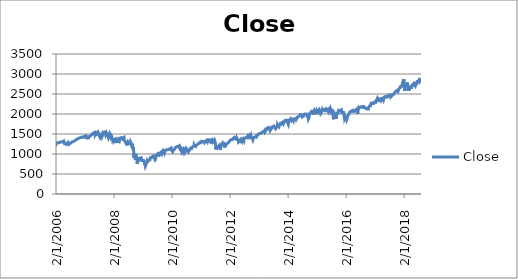
| Category | Close |
|---|---|
| 01/02/2006 | 1282.46 |
| 02/02/2006 | 1270.84 |
| 03/02/2006 | 1264.03 |
| 06/02/2006 | 1265.02 |
| 07/02/2006 | 1254.78 |
| 08/02/2006 | 1265.65 |
| 09/02/2006 | 1263.78 |
| 10/02/2006 | 1266.99 |
| 13/02/2006 | 1262.86 |
| 14/02/2006 | 1275.53 |
| 15/02/2006 | 1280 |
| 16/02/2006 | 1289.38 |
| 17/02/2006 | 1287.24 |
| 21/02/2006 | 1283.03 |
| 22/02/2006 | 1292.67 |
| 23/02/2006 | 1287.79 |
| 24/02/2006 | 1289.43 |
| 27/02/2006 | 1294.12 |
| 28/02/2006 | 1280.66 |
| 01/03/2006 | 1291.24 |
| 02/03/2006 | 1289.14 |
| 03/03/2006 | 1287.23 |
| 06/03/2006 | 1278.26 |
| 07/03/2006 | 1275.88 |
| 08/03/2006 | 1278.47 |
| 09/03/2006 | 1272.23 |
| 10/03/2006 | 1281.42 |
| 13/03/2006 | 1284.13 |
| 14/03/2006 | 1297.48 |
| 15/03/2006 | 1303.02 |
| 16/03/2006 | 1305.33 |
| 17/03/2006 | 1307.25 |
| 20/03/2006 | 1305.08 |
| 21/03/2006 | 1297.23 |
| 22/03/2006 | 1305.04 |
| 23/03/2006 | 1301.67 |
| 24/03/2006 | 1302.95 |
| 27/03/2006 | 1301.61 |
| 28/03/2006 | 1293.23 |
| 29/03/2006 | 1302.89 |
| 30/03/2006 | 1300.25 |
| 31/03/2006 | 1294.87 |
| 03/04/2006 | 1297.81 |
| 04/04/2006 | 1305.93 |
| 05/04/2006 | 1311.56 |
| 06/04/2006 | 1309.04 |
| 07/04/2006 | 1295.5 |
| 10/04/2006 | 1296.62 |
| 11/04/2006 | 1286.57 |
| 12/04/2006 | 1288.12 |
| 13/04/2006 | 1289.12 |
| 17/04/2006 | 1285.33 |
| 18/04/2006 | 1307.28 |
| 19/04/2006 | 1309.93 |
| 20/04/2006 | 1311.46 |
| 21/04/2006 | 1311.28 |
| 24/04/2006 | 1308.11 |
| 25/04/2006 | 1301.74 |
| 26/04/2006 | 1305.41 |
| 27/04/2006 | 1309.72 |
| 28/04/2006 | 1310.61 |
| 01/05/2006 | 1305.19 |
| 02/05/2006 | 1313.21 |
| 03/05/2006 | 1308.12 |
| 04/05/2006 | 1312.25 |
| 05/05/2006 | 1325.76 |
| 08/05/2006 | 1324.66 |
| 09/05/2006 | 1325.14 |
| 10/05/2006 | 1322.85 |
| 11/05/2006 | 1305.92 |
| 12/05/2006 | 1291.24 |
| 15/05/2006 | 1294.5 |
| 16/05/2006 | 1292.08 |
| 17/05/2006 | 1270.32 |
| 18/05/2006 | 1261.81 |
| 19/05/2006 | 1267.03 |
| 22/05/2006 | 1262.07 |
| 23/05/2006 | 1256.58 |
| 24/05/2006 | 1258.57 |
| 25/05/2006 | 1272.88 |
| 26/05/2006 | 1280.16 |
| 30/05/2006 | 1259.87 |
| 31/05/2006 | 1270.09 |
| 01/06/2006 | 1285.71 |
| 02/06/2006 | 1288.22 |
| 05/06/2006 | 1265.29 |
| 06/06/2006 | 1263.85 |
| 07/06/2006 | 1256.15 |
| 08/06/2006 | 1257.93 |
| 09/06/2006 | 1252.3 |
| 12/06/2006 | 1237.44 |
| 13/06/2006 | 1223.69 |
| 14/06/2006 | 1230.04 |
| 15/06/2006 | 1256.16 |
| 16/06/2006 | 1251.54 |
| 19/06/2006 | 1240.13 |
| 20/06/2006 | 1240.12 |
| 21/06/2006 | 1252.2 |
| 22/06/2006 | 1245.6 |
| 23/06/2006 | 1244.5 |
| 26/06/2006 | 1250.56 |
| 27/06/2006 | 1239.2 |
| 28/06/2006 | 1246 |
| 29/06/2006 | 1272.87 |
| 30/06/2006 | 1270.2 |
| 03/07/2006 | 1280.19 |
| 05/07/2006 | 1270.91 |
| 06/07/2006 | 1274.08 |
| 07/07/2006 | 1265.48 |
| 10/07/2006 | 1267.34 |
| 11/07/2006 | 1272.43 |
| 12/07/2006 | 1258.6 |
| 13/07/2006 | 1242.28 |
| 14/07/2006 | 1236.2 |
| 17/07/2006 | 1234.49 |
| 18/07/2006 | 1236.86 |
| 19/07/2006 | 1259.81 |
| 20/07/2006 | 1249.13 |
| 21/07/2006 | 1240.29 |
| 24/07/2006 | 1260.91 |
| 25/07/2006 | 1268.88 |
| 26/07/2006 | 1268.4 |
| 27/07/2006 | 1263.2 |
| 28/07/2006 | 1278.55 |
| 31/07/2006 | 1276.66 |
| 01/08/2006 | 1270.92 |
| 02/08/2006 | 1277.41 |
| 03/08/2006 | 1280.27 |
| 04/08/2006 | 1279.36 |
| 07/08/2006 | 1275.77 |
| 08/08/2006 | 1271.48 |
| 09/08/2006 | 1265.95 |
| 10/08/2006 | 1271.81 |
| 11/08/2006 | 1266.74 |
| 14/08/2006 | 1268.21 |
| 15/08/2006 | 1285.58 |
| 16/08/2006 | 1295.43 |
| 17/08/2006 | 1297.48 |
| 18/08/2006 | 1302.3 |
| 21/08/2006 | 1297.52 |
| 22/08/2006 | 1298.82 |
| 23/08/2006 | 1292.99 |
| 24/08/2006 | 1296.06 |
| 25/08/2006 | 1295.09 |
| 28/08/2006 | 1301.78 |
| 29/08/2006 | 1304.28 |
| 30/08/2006 | 1305.37 |
| 31/08/2006 | 1303.82 |
| 01/09/2006 | 1311.01 |
| 05/09/2006 | 1313.25 |
| 06/09/2006 | 1300.26 |
| 07/09/2006 | 1294.02 |
| 08/09/2006 | 1298.92 |
| 11/09/2006 | 1299.54 |
| 12/09/2006 | 1313 |
| 13/09/2006 | 1318.07 |
| 14/09/2006 | 1316.28 |
| 15/09/2006 | 1319.66 |
| 18/09/2006 | 1321.18 |
| 19/09/2006 | 1317.64 |
| 20/09/2006 | 1325.18 |
| 21/09/2006 | 1318.03 |
| 22/09/2006 | 1314.78 |
| 25/09/2006 | 1326.37 |
| 26/09/2006 | 1336.35 |
| 27/09/2006 | 1336.59 |
| 28/09/2006 | 1338.88 |
| 29/09/2006 | 1335.85 |
| 02/10/2006 | 1331.32 |
| 03/10/2006 | 1334.11 |
| 04/10/2006 | 1350.2 |
| 05/10/2006 | 1353.22 |
| 06/10/2006 | 1349.59 |
| 09/10/2006 | 1350.66 |
| 10/10/2006 | 1353.42 |
| 11/10/2006 | 1349.95 |
| 12/10/2006 | 1362.83 |
| 13/10/2006 | 1365.62 |
| 16/10/2006 | 1369.06 |
| 17/10/2006 | 1364.05 |
| 18/10/2006 | 1365.8 |
| 19/10/2006 | 1366.96 |
| 20/10/2006 | 1368.6 |
| 23/10/2006 | 1377.02 |
| 24/10/2006 | 1377.38 |
| 25/10/2006 | 1382.22 |
| 26/10/2006 | 1389.08 |
| 27/10/2006 | 1377.34 |
| 30/10/2006 | 1377.93 |
| 31/10/2006 | 1377.94 |
| 01/11/2006 | 1367.81 |
| 02/11/2006 | 1367.34 |
| 03/11/2006 | 1364.3 |
| 06/11/2006 | 1379.78 |
| 07/11/2006 | 1382.84 |
| 08/11/2006 | 1385.72 |
| 09/11/2006 | 1378.33 |
| 10/11/2006 | 1380.9 |
| 13/11/2006 | 1384.42 |
| 14/11/2006 | 1393.22 |
| 15/11/2006 | 1396.57 |
| 16/11/2006 | 1399.76 |
| 17/11/2006 | 1401.2 |
| 20/11/2006 | 1400.5 |
| 21/11/2006 | 1402.81 |
| 22/11/2006 | 1406.09 |
| 24/11/2006 | 1400.95 |
| 27/11/2006 | 1381.96 |
| 28/11/2006 | 1386.72 |
| 29/11/2006 | 1399.48 |
| 30/11/2006 | 1400.63 |
| 01/12/2006 | 1396.71 |
| 04/12/2006 | 1409.12 |
| 05/12/2006 | 1414.76 |
| 06/12/2006 | 1412.9 |
| 07/12/2006 | 1407.29 |
| 08/12/2006 | 1409.84 |
| 11/12/2006 | 1413.04 |
| 12/12/2006 | 1411.56 |
| 13/12/2006 | 1413.21 |
| 14/12/2006 | 1425.49 |
| 15/12/2006 | 1427.09 |
| 18/12/2006 | 1422.48 |
| 19/12/2006 | 1425.55 |
| 20/12/2006 | 1423.53 |
| 21/12/2006 | 1418.3 |
| 22/12/2006 | 1410.76 |
| 26/12/2006 | 1416.9 |
| 27/12/2006 | 1426.84 |
| 28/12/2006 | 1424.73 |
| 29/12/2006 | 1418.3 |
| 03/01/2007 | 1416.6 |
| 04/01/2007 | 1418.34 |
| 05/01/2007 | 1409.71 |
| 08/01/2007 | 1412.84 |
| 09/01/2007 | 1412.11 |
| 10/01/2007 | 1414.85 |
| 11/01/2007 | 1423.82 |
| 12/01/2007 | 1430.73 |
| 16/01/2007 | 1431.9 |
| 17/01/2007 | 1430.62 |
| 18/01/2007 | 1426.37 |
| 19/01/2007 | 1430.5 |
| 22/01/2007 | 1422.95 |
| 23/01/2007 | 1427.99 |
| 24/01/2007 | 1440.13 |
| 25/01/2007 | 1423.9 |
| 26/01/2007 | 1422.18 |
| 29/01/2007 | 1420.62 |
| 30/01/2007 | 1428.82 |
| 31/01/2007 | 1438.24 |
| 01/02/2007 | 1445.94 |
| 02/02/2007 | 1448.39 |
| 05/02/2007 | 1446.99 |
| 06/02/2007 | 1448 |
| 07/02/2007 | 1450.02 |
| 08/02/2007 | 1448.31 |
| 09/02/2007 | 1438.06 |
| 12/02/2007 | 1433.37 |
| 13/02/2007 | 1444.26 |
| 14/02/2007 | 1455.3 |
| 15/02/2007 | 1456.81 |
| 16/02/2007 | 1455.54 |
| 20/02/2007 | 1459.68 |
| 21/02/2007 | 1457.63 |
| 22/02/2007 | 1456.38 |
| 23/02/2007 | 1451.19 |
| 26/02/2007 | 1449.37 |
| 27/02/2007 | 1399.04 |
| 28/02/2007 | 1406.82 |
| 01/03/2007 | 1403.17 |
| 02/03/2007 | 1387.17 |
| 05/03/2007 | 1374.12 |
| 06/03/2007 | 1395.41 |
| 07/03/2007 | 1391.97 |
| 08/03/2007 | 1401.89 |
| 09/03/2007 | 1402.84 |
| 12/03/2007 | 1406.6 |
| 13/03/2007 | 1377.95 |
| 14/03/2007 | 1387.17 |
| 15/03/2007 | 1392.28 |
| 16/03/2007 | 1386.95 |
| 19/03/2007 | 1402.06 |
| 20/03/2007 | 1410.94 |
| 21/03/2007 | 1435.04 |
| 22/03/2007 | 1434.54 |
| 23/03/2007 | 1436.11 |
| 26/03/2007 | 1437.5 |
| 27/03/2007 | 1428.61 |
| 28/03/2007 | 1417.23 |
| 29/03/2007 | 1422.53 |
| 30/03/2007 | 1420.86 |
| 02/04/2007 | 1424.55 |
| 03/04/2007 | 1437.77 |
| 04/04/2007 | 1439.37 |
| 05/04/2007 | 1443.76 |
| 09/04/2007 | 1444.61 |
| 10/04/2007 | 1448.39 |
| 11/04/2007 | 1438.87 |
| 12/04/2007 | 1447.8 |
| 13/04/2007 | 1452.85 |
| 16/04/2007 | 1468.33 |
| 17/04/2007 | 1471.48 |
| 18/04/2007 | 1472.5 |
| 19/04/2007 | 1470.73 |
| 20/04/2007 | 1484.35 |
| 23/04/2007 | 1480.93 |
| 24/04/2007 | 1480.41 |
| 25/04/2007 | 1495.42 |
| 26/04/2007 | 1494.25 |
| 27/04/2007 | 1494.07 |
| 30/04/2007 | 1482.37 |
| 01/05/2007 | 1486.3 |
| 02/05/2007 | 1495.92 |
| 03/05/2007 | 1502.39 |
| 04/05/2007 | 1505.62 |
| 07/05/2007 | 1509.48 |
| 08/05/2007 | 1507.72 |
| 09/05/2007 | 1512.58 |
| 10/05/2007 | 1491.47 |
| 11/05/2007 | 1505.85 |
| 14/05/2007 | 1503.15 |
| 15/05/2007 | 1501.19 |
| 16/05/2007 | 1514.14 |
| 17/05/2007 | 1512.75 |
| 18/05/2007 | 1522.75 |
| 21/05/2007 | 1525.1 |
| 22/05/2007 | 1524.12 |
| 23/05/2007 | 1522.28 |
| 24/05/2007 | 1507.51 |
| 25/05/2007 | 1515.73 |
| 29/05/2007 | 1518.11 |
| 30/05/2007 | 1530.23 |
| 31/05/2007 | 1530.62 |
| 01/06/2007 | 1536.34 |
| 04/06/2007 | 1539.18 |
| 05/06/2007 | 1530.95 |
| 06/06/2007 | 1517.38 |
| 07/06/2007 | 1490.72 |
| 08/06/2007 | 1507.67 |
| 11/06/2007 | 1509.12 |
| 12/06/2007 | 1493 |
| 13/06/2007 | 1515.67 |
| 14/06/2007 | 1522.97 |
| 15/06/2007 | 1532.91 |
| 18/06/2007 | 1531.05 |
| 19/06/2007 | 1533.7 |
| 20/06/2007 | 1512.84 |
| 21/06/2007 | 1522.19 |
| 22/06/2007 | 1502.56 |
| 25/06/2007 | 1497.74 |
| 26/06/2007 | 1492.89 |
| 27/06/2007 | 1506.34 |
| 28/06/2007 | 1505.71 |
| 29/06/2007 | 1503.35 |
| 02/07/2007 | 1519.43 |
| 03/07/2007 | 1524.87 |
| 05/07/2007 | 1525.4 |
| 06/07/2007 | 1530.44 |
| 09/07/2007 | 1531.85 |
| 10/07/2007 | 1510.12 |
| 11/07/2007 | 1518.76 |
| 12/07/2007 | 1547.7 |
| 13/07/2007 | 1552.5 |
| 16/07/2007 | 1549.52 |
| 17/07/2007 | 1549.37 |
| 18/07/2007 | 1546.17 |
| 19/07/2007 | 1553.08 |
| 20/07/2007 | 1534.1 |
| 23/07/2007 | 1541.57 |
| 24/07/2007 | 1511.04 |
| 25/07/2007 | 1518.09 |
| 26/07/2007 | 1482.66 |
| 27/07/2007 | 1458.95 |
| 30/07/2007 | 1473.91 |
| 31/07/2007 | 1455.27 |
| 01/08/2007 | 1465.81 |
| 02/08/2007 | 1472.2 |
| 03/08/2007 | 1433.06 |
| 06/08/2007 | 1467.67 |
| 07/08/2007 | 1476.71 |
| 08/08/2007 | 1497.49 |
| 09/08/2007 | 1453.09 |
| 10/08/2007 | 1453.64 |
| 13/08/2007 | 1452.92 |
| 14/08/2007 | 1426.54 |
| 15/08/2007 | 1406.7 |
| 16/08/2007 | 1411.27 |
| 17/08/2007 | 1445.94 |
| 20/08/2007 | 1445.55 |
| 21/08/2007 | 1447.12 |
| 22/08/2007 | 1464.07 |
| 23/08/2007 | 1462.5 |
| 24/08/2007 | 1479.37 |
| 27/08/2007 | 1466.79 |
| 28/08/2007 | 1432.36 |
| 29/08/2007 | 1463.76 |
| 30/08/2007 | 1457.64 |
| 31/08/2007 | 1473.99 |
| 04/09/2007 | 1489.42 |
| 05/09/2007 | 1472.29 |
| 06/09/2007 | 1478.55 |
| 07/09/2007 | 1453.55 |
| 10/09/2007 | 1451.7 |
| 11/09/2007 | 1471.49 |
| 12/09/2007 | 1471.56 |
| 13/09/2007 | 1483.95 |
| 14/09/2007 | 1484.25 |
| 17/09/2007 | 1476.65 |
| 18/09/2007 | 1519.78 |
| 19/09/2007 | 1529.03 |
| 20/09/2007 | 1518.75 |
| 21/09/2007 | 1525.75 |
| 24/09/2007 | 1517.73 |
| 25/09/2007 | 1517.21 |
| 26/09/2007 | 1525.42 |
| 27/09/2007 | 1531.38 |
| 28/09/2007 | 1526.75 |
| 01/10/2007 | 1547.04 |
| 02/10/2007 | 1546.63 |
| 03/10/2007 | 1539.59 |
| 04/10/2007 | 1542.84 |
| 05/10/2007 | 1557.59 |
| 08/10/2007 | 1552.58 |
| 09/10/2007 | 1565.15 |
| 10/10/2007 | 1562.47 |
| 11/10/2007 | 1554.41 |
| 12/10/2007 | 1561.8 |
| 15/10/2007 | 1548.71 |
| 16/10/2007 | 1538.53 |
| 17/10/2007 | 1541.24 |
| 18/10/2007 | 1540.08 |
| 19/10/2007 | 1500.63 |
| 22/10/2007 | 1506.33 |
| 23/10/2007 | 1519.59 |
| 24/10/2007 | 1515.88 |
| 25/10/2007 | 1514.4 |
| 26/10/2007 | 1535.28 |
| 29/10/2007 | 1540.98 |
| 30/10/2007 | 1531.02 |
| 31/10/2007 | 1549.38 |
| 01/11/2007 | 1508.44 |
| 02/11/2007 | 1509.65 |
| 05/11/2007 | 1502.17 |
| 06/11/2007 | 1520.27 |
| 07/11/2007 | 1475.62 |
| 08/11/2007 | 1474.77 |
| 09/11/2007 | 1453.7 |
| 12/11/2007 | 1439.18 |
| 13/11/2007 | 1481.05 |
| 14/11/2007 | 1470.58 |
| 15/11/2007 | 1451.15 |
| 16/11/2007 | 1458.74 |
| 19/11/2007 | 1433.27 |
| 20/11/2007 | 1439.7 |
| 21/11/2007 | 1416.77 |
| 23/11/2007 | 1440.7 |
| 26/11/2007 | 1407.22 |
| 27/11/2007 | 1428.23 |
| 28/11/2007 | 1469.02 |
| 29/11/2007 | 1469.72 |
| 30/11/2007 | 1481.14 |
| 03/12/2007 | 1472.42 |
| 04/12/2007 | 1462.79 |
| 05/12/2007 | 1485.01 |
| 06/12/2007 | 1507.34 |
| 07/12/2007 | 1504.66 |
| 10/12/2007 | 1515.96 |
| 11/12/2007 | 1477.65 |
| 12/12/2007 | 1486.59 |
| 13/12/2007 | 1488.41 |
| 14/12/2007 | 1467.95 |
| 17/12/2007 | 1445.9 |
| 18/12/2007 | 1454.98 |
| 19/12/2007 | 1453 |
| 20/12/2007 | 1460.12 |
| 21/12/2007 | 1484.46 |
| 24/12/2007 | 1496.45 |
| 26/12/2007 | 1497.66 |
| 27/12/2007 | 1476.27 |
| 28/12/2007 | 1478.49 |
| 31/12/2007 | 1468.36 |
| 02/01/2008 | 1447.16 |
| 03/01/2008 | 1447.16 |
| 04/01/2008 | 1411.63 |
| 07/01/2008 | 1416.18 |
| 08/01/2008 | 1390.19 |
| 09/01/2008 | 1409.13 |
| 10/01/2008 | 1420.33 |
| 11/01/2008 | 1401.02 |
| 14/01/2008 | 1416.25 |
| 15/01/2008 | 1380.95 |
| 16/01/2008 | 1373.2 |
| 17/01/2008 | 1333.25 |
| 18/01/2008 | 1325.19 |
| 22/01/2008 | 1310.5 |
| 23/01/2008 | 1338.6 |
| 24/01/2008 | 1352.07 |
| 25/01/2008 | 1330.61 |
| 28/01/2008 | 1353.96 |
| 29/01/2008 | 1362.3 |
| 30/01/2008 | 1355.81 |
| 31/01/2008 | 1378.55 |
| 01/02/2008 | 1395.42 |
| 04/02/2008 | 1380.82 |
| 05/02/2008 | 1336.64 |
| 06/02/2008 | 1326.45 |
| 07/02/2008 | 1336.91 |
| 08/02/2008 | 1331.29 |
| 11/02/2008 | 1339.13 |
| 12/02/2008 | 1348.86 |
| 13/02/2008 | 1367.21 |
| 14/02/2008 | 1348.86 |
| 15/02/2008 | 1349.99 |
| 19/02/2008 | 1348.78 |
| 20/02/2008 | 1360.03 |
| 21/02/2008 | 1342.53 |
| 22/02/2008 | 1353.11 |
| 25/02/2008 | 1371.8 |
| 26/02/2008 | 1381.29 |
| 27/02/2008 | 1380.02 |
| 28/02/2008 | 1367.68 |
| 29/02/2008 | 1330.63 |
| 03/03/2008 | 1331.34 |
| 04/03/2008 | 1326.75 |
| 05/03/2008 | 1333.7 |
| 06/03/2008 | 1304.34 |
| 07/03/2008 | 1293.37 |
| 10/03/2008 | 1273.37 |
| 11/03/2008 | 1320.65 |
| 12/03/2008 | 1308.77 |
| 13/03/2008 | 1315.48 |
| 14/03/2008 | 1288.14 |
| 17/03/2008 | 1276.6 |
| 18/03/2008 | 1330.74 |
| 19/03/2008 | 1298.42 |
| 20/03/2008 | 1329.51 |
| 24/03/2008 | 1349.88 |
| 25/03/2008 | 1352.99 |
| 26/03/2008 | 1341.13 |
| 27/03/2008 | 1325.76 |
| 28/03/2008 | 1315.22 |
| 31/03/2008 | 1322.7 |
| 01/04/2008 | 1370.18 |
| 02/04/2008 | 1367.53 |
| 03/04/2008 | 1369.31 |
| 04/04/2008 | 1370.4 |
| 07/04/2008 | 1372.54 |
| 08/04/2008 | 1365.54 |
| 09/04/2008 | 1354.49 |
| 10/04/2008 | 1360.55 |
| 11/04/2008 | 1332.83 |
| 14/04/2008 | 1328.32 |
| 15/04/2008 | 1334.43 |
| 16/04/2008 | 1364.71 |
| 17/04/2008 | 1365.56 |
| 18/04/2008 | 1390.33 |
| 21/04/2008 | 1388.17 |
| 22/04/2008 | 1375.94 |
| 23/04/2008 | 1379.93 |
| 24/04/2008 | 1388.82 |
| 25/04/2008 | 1397.84 |
| 28/04/2008 | 1396.37 |
| 29/04/2008 | 1390.94 |
| 30/04/2008 | 1385.59 |
| 01/05/2008 | 1409.34 |
| 02/05/2008 | 1413.9 |
| 05/05/2008 | 1407.49 |
| 06/05/2008 | 1418.26 |
| 07/05/2008 | 1392.57 |
| 08/05/2008 | 1397.68 |
| 09/05/2008 | 1388.28 |
| 12/05/2008 | 1403.58 |
| 13/05/2008 | 1403.04 |
| 14/05/2008 | 1408.66 |
| 15/05/2008 | 1423.57 |
| 16/05/2008 | 1425.35 |
| 19/05/2008 | 1426.63 |
| 20/05/2008 | 1413.4 |
| 21/05/2008 | 1390.71 |
| 22/05/2008 | 1394.35 |
| 23/05/2008 | 1375.93 |
| 27/05/2008 | 1385.35 |
| 28/05/2008 | 1390.84 |
| 29/05/2008 | 1398.26 |
| 30/05/2008 | 1400.38 |
| 02/06/2008 | 1385.67 |
| 03/06/2008 | 1377.65 |
| 04/06/2008 | 1377.2 |
| 05/06/2008 | 1404.05 |
| 06/06/2008 | 1360.68 |
| 09/06/2008 | 1361.76 |
| 10/06/2008 | 1358.44 |
| 11/06/2008 | 1335.49 |
| 12/06/2008 | 1339.87 |
| 13/06/2008 | 1360.03 |
| 16/06/2008 | 1360.14 |
| 17/06/2008 | 1350.93 |
| 18/06/2008 | 1337.81 |
| 19/06/2008 | 1342.83 |
| 20/06/2008 | 1317.93 |
| 23/06/2008 | 1318 |
| 24/06/2008 | 1314.29 |
| 25/06/2008 | 1321.97 |
| 26/06/2008 | 1283.15 |
| 27/06/2008 | 1278.38 |
| 30/06/2008 | 1280 |
| 01/07/2008 | 1284.91 |
| 02/07/2008 | 1261.52 |
| 03/07/2008 | 1262.9 |
| 07/07/2008 | 1252.31 |
| 08/07/2008 | 1273.7 |
| 09/07/2008 | 1244.69 |
| 10/07/2008 | 1253.39 |
| 11/07/2008 | 1239.49 |
| 14/07/2008 | 1228.3 |
| 15/07/2008 | 1214.91 |
| 16/07/2008 | 1245.36 |
| 17/07/2008 | 1260.32 |
| 18/07/2008 | 1260.68 |
| 21/07/2008 | 1260 |
| 22/07/2008 | 1277 |
| 23/07/2008 | 1282.19 |
| 24/07/2008 | 1252.54 |
| 25/07/2008 | 1257.76 |
| 28/07/2008 | 1234.37 |
| 29/07/2008 | 1263.2 |
| 30/07/2008 | 1284.26 |
| 31/07/2008 | 1267.38 |
| 01/08/2008 | 1260.31 |
| 04/08/2008 | 1249.01 |
| 05/08/2008 | 1284.88 |
| 06/08/2008 | 1289.19 |
| 07/08/2008 | 1266.07 |
| 08/08/2008 | 1296.32 |
| 11/08/2008 | 1305.32 |
| 12/08/2008 | 1289.59 |
| 13/08/2008 | 1285.83 |
| 14/08/2008 | 1292.93 |
| 15/08/2008 | 1298.2 |
| 18/08/2008 | 1278.6 |
| 19/08/2008 | 1266.69 |
| 20/08/2008 | 1274.54 |
| 21/08/2008 | 1277.72 |
| 22/08/2008 | 1292.2 |
| 25/08/2008 | 1266.84 |
| 26/08/2008 | 1271.51 |
| 27/08/2008 | 1281.66 |
| 28/08/2008 | 1300.68 |
| 29/08/2008 | 1282.83 |
| 02/09/2008 | 1277.58 |
| 03/09/2008 | 1274.98 |
| 04/09/2008 | 1236.83 |
| 05/09/2008 | 1242.31 |
| 08/09/2008 | 1267.79 |
| 09/09/2008 | 1224.51 |
| 10/09/2008 | 1232.04 |
| 11/09/2008 | 1249.05 |
| 12/09/2008 | 1251.7 |
| 15/09/2008 | 1192.7 |
| 16/09/2008 | 1213.6 |
| 17/09/2008 | 1156.39 |
| 18/09/2008 | 1206.51 |
| 19/09/2008 | 1255.08 |
| 22/09/2008 | 1207.09 |
| 23/09/2008 | 1188.22 |
| 24/09/2008 | 1185.87 |
| 25/09/2008 | 1209.18 |
| 26/09/2008 | 1213.27 |
| 29/09/2008 | 1106.42 |
| 30/09/2008 | 1166.36 |
| 01/10/2008 | 1161.06 |
| 02/10/2008 | 1114.28 |
| 03/10/2008 | 1099.23 |
| 06/10/2008 | 1056.89 |
| 07/10/2008 | 996.23 |
| 08/10/2008 | 984.94 |
| 09/10/2008 | 909.92 |
| 10/10/2008 | 899.22 |
| 13/10/2008 | 1003.35 |
| 14/10/2008 | 998.01 |
| 15/10/2008 | 907.84 |
| 16/10/2008 | 946.43 |
| 17/10/2008 | 940.55 |
| 20/10/2008 | 985.4 |
| 21/10/2008 | 955.05 |
| 22/10/2008 | 896.78 |
| 23/10/2008 | 908.11 |
| 24/10/2008 | 876.77 |
| 27/10/2008 | 848.92 |
| 28/10/2008 | 940.51 |
| 29/10/2008 | 930.09 |
| 30/10/2008 | 954.09 |
| 31/10/2008 | 968.75 |
| 03/11/2008 | 966.3 |
| 04/11/2008 | 1005.75 |
| 05/11/2008 | 952.77 |
| 06/11/2008 | 904.88 |
| 07/11/2008 | 930.99 |
| 10/11/2008 | 919.21 |
| 11/11/2008 | 898.95 |
| 12/11/2008 | 852.3 |
| 13/11/2008 | 911.29 |
| 14/11/2008 | 873.29 |
| 17/11/2008 | 850.75 |
| 18/11/2008 | 859.12 |
| 19/11/2008 | 806.58 |
| 20/11/2008 | 752.44 |
| 21/11/2008 | 800.03 |
| 24/11/2008 | 851.81 |
| 25/11/2008 | 857.39 |
| 26/11/2008 | 887.68 |
| 28/11/2008 | 896.24 |
| 01/12/2008 | 816.21 |
| 02/12/2008 | 848.81 |
| 03/12/2008 | 870.74 |
| 04/12/2008 | 845.22 |
| 05/12/2008 | 876.07 |
| 08/12/2008 | 909.7 |
| 09/12/2008 | 888.67 |
| 10/12/2008 | 899.24 |
| 11/12/2008 | 873.59 |
| 12/12/2008 | 879.73 |
| 15/12/2008 | 868.57 |
| 16/12/2008 | 913.18 |
| 17/12/2008 | 904.42 |
| 18/12/2008 | 885.28 |
| 19/12/2008 | 887.88 |
| 22/12/2008 | 871.63 |
| 23/12/2008 | 863.16 |
| 24/12/2008 | 868.15 |
| 26/12/2008 | 872.8 |
| 29/12/2008 | 869.42 |
| 30/12/2008 | 890.64 |
| 31/12/2008 | 903.25 |
| 02/01/2009 | 931.8 |
| 05/01/2009 | 927.45 |
| 06/01/2009 | 934.7 |
| 07/01/2009 | 906.65 |
| 08/01/2009 | 909.73 |
| 09/01/2009 | 890.35 |
| 12/01/2009 | 870.26 |
| 13/01/2009 | 871.79 |
| 14/01/2009 | 842.62 |
| 15/01/2009 | 843.74 |
| 16/01/2009 | 850.12 |
| 20/01/2009 | 805.22 |
| 21/01/2009 | 840.24 |
| 22/01/2009 | 827.5 |
| 23/01/2009 | 831.95 |
| 26/01/2009 | 836.57 |
| 27/01/2009 | 845.71 |
| 28/01/2009 | 874.09 |
| 29/01/2009 | 845.14 |
| 30/01/2009 | 825.88 |
| 02/02/2009 | 825.44 |
| 03/02/2009 | 838.51 |
| 04/02/2009 | 832.23 |
| 05/02/2009 | 845.85 |
| 06/02/2009 | 868.6 |
| 09/02/2009 | 869.89 |
| 10/02/2009 | 827.16 |
| 11/02/2009 | 833.74 |
| 12/02/2009 | 835.19 |
| 13/02/2009 | 826.84 |
| 17/02/2009 | 789.17 |
| 18/02/2009 | 788.42 |
| 19/02/2009 | 778.94 |
| 20/02/2009 | 770.05 |
| 23/02/2009 | 743.33 |
| 24/02/2009 | 773.14 |
| 25/02/2009 | 764.9 |
| 26/02/2009 | 752.83 |
| 27/02/2009 | 735.09 |
| 02/03/2009 | 700.82 |
| 03/03/2009 | 696.33 |
| 04/03/2009 | 712.87 |
| 05/03/2009 | 682.55 |
| 06/03/2009 | 683.38 |
| 09/03/2009 | 676.53 |
| 10/03/2009 | 719.6 |
| 11/03/2009 | 721.36 |
| 12/03/2009 | 750.74 |
| 13/03/2009 | 756.55 |
| 16/03/2009 | 753.89 |
| 17/03/2009 | 778.12 |
| 18/03/2009 | 794.35 |
| 19/03/2009 | 784.04 |
| 20/03/2009 | 768.54 |
| 23/03/2009 | 822.92 |
| 24/03/2009 | 806.12 |
| 25/03/2009 | 813.88 |
| 26/03/2009 | 832.86 |
| 27/03/2009 | 815.94 |
| 30/03/2009 | 787.53 |
| 31/03/2009 | 797.87 |
| 01/04/2009 | 811.08 |
| 02/04/2009 | 834.38 |
| 03/04/2009 | 842.5 |
| 06/04/2009 | 835.48 |
| 07/04/2009 | 815.55 |
| 08/04/2009 | 825.16 |
| 09/04/2009 | 856.56 |
| 13/04/2009 | 858.73 |
| 14/04/2009 | 841.5 |
| 15/04/2009 | 852.06 |
| 16/04/2009 | 865.3 |
| 17/04/2009 | 869.6 |
| 20/04/2009 | 832.39 |
| 21/04/2009 | 850.08 |
| 22/04/2009 | 843.55 |
| 23/04/2009 | 851.92 |
| 24/04/2009 | 866.23 |
| 27/04/2009 | 857.51 |
| 28/04/2009 | 855.16 |
| 29/04/2009 | 873.64 |
| 30/04/2009 | 872.81 |
| 01/05/2009 | 877.52 |
| 04/05/2009 | 907.24 |
| 05/05/2009 | 903.8 |
| 06/05/2009 | 919.53 |
| 07/05/2009 | 907.39 |
| 08/05/2009 | 929.23 |
| 11/05/2009 | 909.24 |
| 12/05/2009 | 908.35 |
| 13/05/2009 | 883.92 |
| 14/05/2009 | 893.07 |
| 15/05/2009 | 882.88 |
| 18/05/2009 | 909.71 |
| 19/05/2009 | 908.13 |
| 20/05/2009 | 903.47 |
| 21/05/2009 | 888.33 |
| 22/05/2009 | 887 |
| 26/05/2009 | 910.33 |
| 27/05/2009 | 893.06 |
| 28/05/2009 | 906.83 |
| 29/05/2009 | 919.14 |
| 01/06/2009 | 942.87 |
| 02/06/2009 | 944.74 |
| 03/06/2009 | 931.76 |
| 04/06/2009 | 942.46 |
| 05/06/2009 | 940.09 |
| 08/06/2009 | 939.14 |
| 09/06/2009 | 942.43 |
| 10/06/2009 | 939.15 |
| 11/06/2009 | 944.89 |
| 12/06/2009 | 946.21 |
| 15/06/2009 | 923.72 |
| 16/06/2009 | 911.97 |
| 17/06/2009 | 910.71 |
| 18/06/2009 | 918.37 |
| 19/06/2009 | 921.23 |
| 22/06/2009 | 893.04 |
| 23/06/2009 | 895.1 |
| 24/06/2009 | 900.94 |
| 25/06/2009 | 920.26 |
| 26/06/2009 | 918.9 |
| 29/06/2009 | 927.23 |
| 30/06/2009 | 919.32 |
| 01/07/2009 | 923.33 |
| 02/07/2009 | 896.42 |
| 06/07/2009 | 898.72 |
| 07/07/2009 | 881.03 |
| 08/07/2009 | 879.56 |
| 09/07/2009 | 882.68 |
| 10/07/2009 | 879.13 |
| 13/07/2009 | 901.05 |
| 14/07/2009 | 905.84 |
| 15/07/2009 | 932.68 |
| 16/07/2009 | 940.74 |
| 17/07/2009 | 940.38 |
| 20/07/2009 | 951.13 |
| 21/07/2009 | 954.58 |
| 22/07/2009 | 954.07 |
| 23/07/2009 | 976.29 |
| 24/07/2009 | 979.26 |
| 27/07/2009 | 982.18 |
| 28/07/2009 | 979.62 |
| 29/07/2009 | 975.15 |
| 30/07/2009 | 986.75 |
| 31/07/2009 | 987.48 |
| 03/08/2009 | 1002.63 |
| 04/08/2009 | 1005.65 |
| 05/08/2009 | 1002.72 |
| 06/08/2009 | 997.08 |
| 07/08/2009 | 1010.48 |
| 10/08/2009 | 1007.1 |
| 11/08/2009 | 994.35 |
| 12/08/2009 | 1005.81 |
| 13/08/2009 | 1012.73 |
| 14/08/2009 | 1004.09 |
| 17/08/2009 | 979.73 |
| 18/08/2009 | 989.67 |
| 19/08/2009 | 996.46 |
| 20/08/2009 | 1007.37 |
| 21/08/2009 | 1026.13 |
| 24/08/2009 | 1025.57 |
| 25/08/2009 | 1028 |
| 26/08/2009 | 1028.12 |
| 27/08/2009 | 1030.98 |
| 28/08/2009 | 1028.93 |
| 31/08/2009 | 1020.62 |
| 01/09/2009 | 998.04 |
| 02/09/2009 | 994.75 |
| 03/09/2009 | 1003.24 |
| 04/09/2009 | 1016.4 |
| 08/09/2009 | 1025.39 |
| 09/09/2009 | 1033.37 |
| 10/09/2009 | 1044.14 |
| 11/09/2009 | 1042.73 |
| 14/09/2009 | 1049.34 |
| 15/09/2009 | 1052.63 |
| 16/09/2009 | 1068.76 |
| 17/09/2009 | 1065.49 |
| 18/09/2009 | 1068.3 |
| 21/09/2009 | 1064.66 |
| 22/09/2009 | 1071.66 |
| 23/09/2009 | 1060.87 |
| 24/09/2009 | 1050.78 |
| 25/09/2009 | 1044.38 |
| 28/09/2009 | 1062.98 |
| 29/09/2009 | 1060.61 |
| 30/09/2009 | 1057.08 |
| 01/10/2009 | 1029.85 |
| 02/10/2009 | 1025.21 |
| 05/10/2009 | 1040.46 |
| 06/10/2009 | 1054.72 |
| 07/10/2009 | 1057.58 |
| 08/10/2009 | 1065.48 |
| 09/10/2009 | 1071.49 |
| 12/10/2009 | 1076.19 |
| 13/10/2009 | 1073.19 |
| 14/10/2009 | 1092.02 |
| 15/10/2009 | 1096.56 |
| 16/10/2009 | 1087.68 |
| 19/10/2009 | 1097.91 |
| 20/10/2009 | 1091.06 |
| 21/10/2009 | 1081.4 |
| 22/10/2009 | 1092.91 |
| 23/10/2009 | 1079.6 |
| 26/10/2009 | 1066.95 |
| 27/10/2009 | 1063.41 |
| 28/10/2009 | 1042.63 |
| 29/10/2009 | 1066.11 |
| 30/10/2009 | 1036.19 |
| 02/11/2009 | 1042.88 |
| 03/11/2009 | 1045.41 |
| 04/11/2009 | 1046.5 |
| 05/11/2009 | 1066.63 |
| 06/11/2009 | 1069.3 |
| 09/11/2009 | 1093.08 |
| 10/11/2009 | 1093.01 |
| 11/11/2009 | 1098.51 |
| 12/11/2009 | 1087.24 |
| 13/11/2009 | 1093.48 |
| 16/11/2009 | 1109.3 |
| 17/11/2009 | 1110.32 |
| 18/11/2009 | 1109.8 |
| 19/11/2009 | 1094.9 |
| 20/11/2009 | 1091.38 |
| 23/11/2009 | 1106.24 |
| 24/11/2009 | 1105.65 |
| 25/11/2009 | 1110.63 |
| 27/11/2009 | 1091.49 |
| 30/11/2009 | 1095.63 |
| 01/12/2009 | 1108.86 |
| 02/12/2009 | 1109.24 |
| 03/12/2009 | 1099.92 |
| 04/12/2009 | 1105.98 |
| 07/12/2009 | 1103.25 |
| 08/12/2009 | 1091.94 |
| 09/12/2009 | 1095.95 |
| 10/12/2009 | 1102.35 |
| 11/12/2009 | 1106.41 |
| 14/12/2009 | 1114.11 |
| 15/12/2009 | 1107.93 |
| 16/12/2009 | 1109.18 |
| 17/12/2009 | 1096.08 |
| 18/12/2009 | 1102.47 |
| 21/12/2009 | 1114.05 |
| 22/12/2009 | 1118.02 |
| 23/12/2009 | 1120.59 |
| 24/12/2009 | 1126.48 |
| 28/12/2009 | 1127.78 |
| 29/12/2009 | 1126.2 |
| 30/12/2009 | 1126.42 |
| 31/12/2009 | 1115.1 |
| 04/01/2010 | 1132.99 |
| 05/01/2010 | 1136.52 |
| 06/01/2010 | 1137.14 |
| 07/01/2010 | 1141.69 |
| 08/01/2010 | 1144.98 |
| 11/01/2010 | 1146.98 |
| 12/01/2010 | 1136.22 |
| 13/01/2010 | 1145.68 |
| 14/01/2010 | 1148.46 |
| 15/01/2010 | 1136.03 |
| 19/01/2010 | 1150.23 |
| 20/01/2010 | 1138.04 |
| 21/01/2010 | 1116.48 |
| 22/01/2010 | 1091.76 |
| 25/01/2010 | 1096.78 |
| 26/01/2010 | 1092.17 |
| 27/01/2010 | 1097.5 |
| 28/01/2010 | 1084.53 |
| 29/01/2010 | 1073.87 |
| 01/02/2010 | 1089.19 |
| 02/02/2010 | 1103.32 |
| 03/02/2010 | 1097.28 |
| 04/02/2010 | 1063.11 |
| 05/02/2010 | 1066.19 |
| 08/02/2010 | 1056.74 |
| 09/02/2010 | 1070.52 |
| 10/02/2010 | 1068.13 |
| 11/02/2010 | 1078.47 |
| 12/02/2010 | 1075.51 |
| 16/02/2010 | 1094.87 |
| 17/02/2010 | 1099.51 |
| 18/02/2010 | 1106.75 |
| 19/02/2010 | 1109.17 |
| 22/02/2010 | 1108.01 |
| 23/02/2010 | 1094.6 |
| 24/02/2010 | 1105.24 |
| 25/02/2010 | 1102.94 |
| 26/02/2010 | 1104.49 |
| 01/03/2010 | 1115.71 |
| 02/03/2010 | 1118.31 |
| 03/03/2010 | 1118.79 |
| 04/03/2010 | 1122.97 |
| 05/03/2010 | 1138.7 |
| 08/03/2010 | 1138.5 |
| 09/03/2010 | 1140.45 |
| 10/03/2010 | 1145.61 |
| 11/03/2010 | 1150.24 |
| 12/03/2010 | 1149.99 |
| 15/03/2010 | 1150.51 |
| 16/03/2010 | 1159.46 |
| 17/03/2010 | 1166.21 |
| 18/03/2010 | 1165.83 |
| 19/03/2010 | 1159.9 |
| 22/03/2010 | 1165.81 |
| 23/03/2010 | 1174.17 |
| 24/03/2010 | 1167.72 |
| 25/03/2010 | 1165.73 |
| 26/03/2010 | 1166.59 |
| 29/03/2010 | 1173.22 |
| 30/03/2010 | 1173.27 |
| 31/03/2010 | 1169.43 |
| 01/04/2010 | 1178.1 |
| 05/04/2010 | 1187.44 |
| 06/04/2010 | 1189.44 |
| 07/04/2010 | 1182.45 |
| 08/04/2010 | 1186.44 |
| 09/04/2010 | 1194.37 |
| 12/04/2010 | 1196.48 |
| 13/04/2010 | 1197.3 |
| 14/04/2010 | 1210.65 |
| 15/04/2010 | 1211.67 |
| 16/04/2010 | 1192.13 |
| 19/04/2010 | 1197.52 |
| 20/04/2010 | 1207.17 |
| 21/04/2010 | 1205.94 |
| 22/04/2010 | 1208.67 |
| 23/04/2010 | 1217.28 |
| 26/04/2010 | 1212.05 |
| 27/04/2010 | 1183.71 |
| 28/04/2010 | 1191.36 |
| 29/04/2010 | 1206.78 |
| 30/04/2010 | 1186.69 |
| 03/05/2010 | 1202.26 |
| 04/05/2010 | 1173.6 |
| 05/05/2010 | 1165.87 |
| 06/05/2010 | 1128.15 |
| 07/05/2010 | 1110.88 |
| 10/05/2010 | 1159.73 |
| 11/05/2010 | 1155.79 |
| 12/05/2010 | 1171.67 |
| 13/05/2010 | 1157.44 |
| 14/05/2010 | 1135.68 |
| 17/05/2010 | 1136.94 |
| 18/05/2010 | 1120.8 |
| 19/05/2010 | 1115.05 |
| 20/05/2010 | 1071.59 |
| 21/05/2010 | 1087.69 |
| 24/05/2010 | 1073.65 |
| 25/05/2010 | 1074.03 |
| 26/05/2010 | 1067.95 |
| 27/05/2010 | 1103.06 |
| 28/05/2010 | 1089.41 |
| 01/06/2010 | 1070.71 |
| 02/06/2010 | 1098.38 |
| 03/06/2010 | 1102.83 |
| 04/06/2010 | 1064.88 |
| 07/06/2010 | 1050.47 |
| 08/06/2010 | 1062 |
| 09/06/2010 | 1055.69 |
| 10/06/2010 | 1086.84 |
| 11/06/2010 | 1091.6 |
| 14/06/2010 | 1089.63 |
| 15/06/2010 | 1115.23 |
| 16/06/2010 | 1114.61 |
| 17/06/2010 | 1116.04 |
| 18/06/2010 | 1117.51 |
| 21/06/2010 | 1113.2 |
| 22/06/2010 | 1095.31 |
| 23/06/2010 | 1092.04 |
| 24/06/2010 | 1073.69 |
| 25/06/2010 | 1076.76 |
| 28/06/2010 | 1074.57 |
| 29/06/2010 | 1041.24 |
| 30/06/2010 | 1030.71 |
| 01/07/2010 | 1027.37 |
| 02/07/2010 | 1022.58 |
| 06/07/2010 | 1028.06 |
| 07/07/2010 | 1060.27 |
| 08/07/2010 | 1070.25 |
| 09/07/2010 | 1077.96 |
| 12/07/2010 | 1078.75 |
| 13/07/2010 | 1095.34 |
| 14/07/2010 | 1095.17 |
| 15/07/2010 | 1096.48 |
| 16/07/2010 | 1064.88 |
| 19/07/2010 | 1071.25 |
| 20/07/2010 | 1083.48 |
| 21/07/2010 | 1069.59 |
| 22/07/2010 | 1093.67 |
| 23/07/2010 | 1102.66 |
| 26/07/2010 | 1115.01 |
| 27/07/2010 | 1113.84 |
| 28/07/2010 | 1106.13 |
| 29/07/2010 | 1101.53 |
| 30/07/2010 | 1101.6 |
| 02/08/2010 | 1125.86 |
| 03/08/2010 | 1120.46 |
| 04/08/2010 | 1127.24 |
| 05/08/2010 | 1125.81 |
| 06/08/2010 | 1121.64 |
| 09/08/2010 | 1127.79 |
| 10/08/2010 | 1121.06 |
| 11/08/2010 | 1089.47 |
| 12/08/2010 | 1083.61 |
| 13/08/2010 | 1079.25 |
| 16/08/2010 | 1079.38 |
| 17/08/2010 | 1092.54 |
| 18/08/2010 | 1094.16 |
| 19/08/2010 | 1075.63 |
| 20/08/2010 | 1071.69 |
| 23/08/2010 | 1067.36 |
| 24/08/2010 | 1051.87 |
| 25/08/2010 | 1055.33 |
| 26/08/2010 | 1047.22 |
| 27/08/2010 | 1064.59 |
| 30/08/2010 | 1048.92 |
| 31/08/2010 | 1049.33 |
| 01/09/2010 | 1080.29 |
| 02/09/2010 | 1090.1 |
| 03/09/2010 | 1104.51 |
| 07/09/2010 | 1091.84 |
| 08/09/2010 | 1098.87 |
| 09/09/2010 | 1104.18 |
| 10/09/2010 | 1109.55 |
| 13/09/2010 | 1121.9 |
| 14/09/2010 | 1121.1 |
| 15/09/2010 | 1125.07 |
| 16/09/2010 | 1124.66 |
| 17/09/2010 | 1125.59 |
| 20/09/2010 | 1142.71 |
| 21/09/2010 | 1139.78 |
| 22/09/2010 | 1134.28 |
| 23/09/2010 | 1124.83 |
| 24/09/2010 | 1148.67 |
| 27/09/2010 | 1142.16 |
| 28/09/2010 | 1147.7 |
| 29/09/2010 | 1144.73 |
| 30/09/2010 | 1141.2 |
| 01/10/2010 | 1146.24 |
| 04/10/2010 | 1137.03 |
| 05/10/2010 | 1160.75 |
| 06/10/2010 | 1159.97 |
| 07/10/2010 | 1158.06 |
| 08/10/2010 | 1165.15 |
| 11/10/2010 | 1165.32 |
| 12/10/2010 | 1169.77 |
| 13/10/2010 | 1178.1 |
| 14/10/2010 | 1173.81 |
| 15/10/2010 | 1176.19 |
| 18/10/2010 | 1184.71 |
| 19/10/2010 | 1165.9 |
| 20/10/2010 | 1178.17 |
| 21/10/2010 | 1180.26 |
| 22/10/2010 | 1183.08 |
| 25/10/2010 | 1185.62 |
| 26/10/2010 | 1185.64 |
| 27/10/2010 | 1182.45 |
| 28/10/2010 | 1183.78 |
| 29/10/2010 | 1183.26 |
| 01/11/2010 | 1184.38 |
| 02/11/2010 | 1193.57 |
| 03/11/2010 | 1197.96 |
| 04/11/2010 | 1221.06 |
| 05/11/2010 | 1225.85 |
| 08/11/2010 | 1223.25 |
| 09/11/2010 | 1213.4 |
| 10/11/2010 | 1218.71 |
| 11/11/2010 | 1213.54 |
| 12/11/2010 | 1199.21 |
| 15/11/2010 | 1197.75 |
| 16/11/2010 | 1178.34 |
| 17/11/2010 | 1178.59 |
| 18/11/2010 | 1196.69 |
| 19/11/2010 | 1199.73 |
| 22/11/2010 | 1197.84 |
| 23/11/2010 | 1180.73 |
| 24/11/2010 | 1198.35 |
| 26/11/2010 | 1189.4 |
| 29/11/2010 | 1187.76 |
| 30/11/2010 | 1180.55 |
| 01/12/2010 | 1206.07 |
| 02/12/2010 | 1221.53 |
| 03/12/2010 | 1224.71 |
| 06/12/2010 | 1223.12 |
| 07/12/2010 | 1223.75 |
| 08/12/2010 | 1228.28 |
| 09/12/2010 | 1233 |
| 10/12/2010 | 1240.4 |
| 13/12/2010 | 1240.46 |
| 14/12/2010 | 1241.59 |
| 15/12/2010 | 1235.23 |
| 16/12/2010 | 1242.87 |
| 17/12/2010 | 1243.91 |
| 20/12/2010 | 1247.08 |
| 21/12/2010 | 1254.6 |
| 22/12/2010 | 1258.84 |
| 23/12/2010 | 1256.77 |
| 27/12/2010 | 1257.54 |
| 28/12/2010 | 1258.51 |
| 29/12/2010 | 1259.78 |
| 30/12/2010 | 1257.88 |
| 31/12/2010 | 1257.64 |
| 03/01/2011 | 1271.87 |
| 04/01/2011 | 1270.2 |
| 05/01/2011 | 1276.56 |
| 06/01/2011 | 1273.85 |
| 07/01/2011 | 1271.5 |
| 10/01/2011 | 1269.75 |
| 11/01/2011 | 1274.48 |
| 12/01/2011 | 1285.96 |
| 13/01/2011 | 1283.76 |
| 14/01/2011 | 1293.24 |
| 18/01/2011 | 1295.02 |
| 19/01/2011 | 1281.92 |
| 20/01/2011 | 1280.26 |
| 21/01/2011 | 1283.35 |
| 24/01/2011 | 1290.84 |
| 25/01/2011 | 1291.18 |
| 26/01/2011 | 1296.63 |
| 27/01/2011 | 1299.54 |
| 28/01/2011 | 1276.34 |
| 31/01/2011 | 1286.12 |
| 01/02/2011 | 1307.59 |
| 02/02/2011 | 1304.03 |
| 03/02/2011 | 1307.1 |
| 04/02/2011 | 1310.87 |
| 07/02/2011 | 1319.05 |
| 08/02/2011 | 1324.57 |
| 09/02/2011 | 1320.88 |
| 10/02/2011 | 1321.87 |
| 11/02/2011 | 1329.15 |
| 14/02/2011 | 1332.32 |
| 15/02/2011 | 1328.01 |
| 16/02/2011 | 1336.32 |
| 17/02/2011 | 1340.43 |
| 18/02/2011 | 1343.01 |
| 22/02/2011 | 1315.44 |
| 23/02/2011 | 1307.4 |
| 24/02/2011 | 1306.1 |
| 25/02/2011 | 1319.88 |
| 28/02/2011 | 1327.22 |
| 01/03/2011 | 1306.33 |
| 02/03/2011 | 1308.44 |
| 03/03/2011 | 1330.97 |
| 04/03/2011 | 1321.15 |
| 07/03/2011 | 1310.13 |
| 08/03/2011 | 1321.82 |
| 09/03/2011 | 1320.02 |
| 10/03/2011 | 1295.11 |
| 11/03/2011 | 1304.28 |
| 14/03/2011 | 1296.39 |
| 15/03/2011 | 1281.87 |
| 16/03/2011 | 1256.88 |
| 17/03/2011 | 1273.72 |
| 18/03/2011 | 1279.21 |
| 21/03/2011 | 1298.38 |
| 22/03/2011 | 1293.77 |
| 23/03/2011 | 1297.54 |
| 24/03/2011 | 1309.66 |
| 25/03/2011 | 1313.8 |
| 28/03/2011 | 1310.19 |
| 29/03/2011 | 1319.44 |
| 30/03/2011 | 1328.26 |
| 31/03/2011 | 1325.83 |
| 01/04/2011 | 1332.41 |
| 04/04/2011 | 1332.87 |
| 05/04/2011 | 1332.63 |
| 06/04/2011 | 1335.54 |
| 07/04/2011 | 1333.51 |
| 08/04/2011 | 1328.17 |
| 11/04/2011 | 1324.46 |
| 12/04/2011 | 1314.16 |
| 13/04/2011 | 1314.41 |
| 14/04/2011 | 1314.52 |
| 15/04/2011 | 1319.68 |
| 18/04/2011 | 1305.14 |
| 19/04/2011 | 1312.62 |
| 20/04/2011 | 1330.36 |
| 21/04/2011 | 1337.38 |
| 25/04/2011 | 1335.25 |
| 26/04/2011 | 1347.24 |
| 27/04/2011 | 1355.66 |
| 28/04/2011 | 1360.48 |
| 29/04/2011 | 1363.61 |
| 02/05/2011 | 1361.22 |
| 03/05/2011 | 1356.62 |
| 04/05/2011 | 1347.32 |
| 05/05/2011 | 1335.1 |
| 06/05/2011 | 1340.2 |
| 09/05/2011 | 1346.29 |
| 10/05/2011 | 1357.16 |
| 11/05/2011 | 1342.08 |
| 12/05/2011 | 1348.65 |
| 13/05/2011 | 1337.77 |
| 16/05/2011 | 1329.47 |
| 17/05/2011 | 1328.98 |
| 18/05/2011 | 1340.68 |
| 19/05/2011 | 1343.6 |
| 20/05/2011 | 1333.27 |
| 23/05/2011 | 1317.37 |
| 24/05/2011 | 1316.28 |
| 25/05/2011 | 1320.47 |
| 26/05/2011 | 1325.69 |
| 27/05/2011 | 1331.1 |
| 31/05/2011 | 1345.2 |
| 01/06/2011 | 1314.55 |
| 02/06/2011 | 1312.94 |
| 03/06/2011 | 1300.16 |
| 06/06/2011 | 1286.17 |
| 07/06/2011 | 1284.94 |
| 08/06/2011 | 1279.56 |
| 09/06/2011 | 1289 |
| 10/06/2011 | 1270.98 |
| 13/06/2011 | 1271.83 |
| 14/06/2011 | 1287.87 |
| 15/06/2011 | 1265.42 |
| 16/06/2011 | 1267.64 |
| 17/06/2011 | 1271.5 |
| 20/06/2011 | 1278.36 |
| 21/06/2011 | 1295.52 |
| 22/06/2011 | 1287.14 |
| 23/06/2011 | 1283.5 |
| 24/06/2011 | 1268.45 |
| 27/06/2011 | 1280.1 |
| 28/06/2011 | 1296.67 |
| 29/06/2011 | 1307.41 |
| 30/06/2011 | 1320.64 |
| 01/07/2011 | 1339.67 |
| 05/07/2011 | 1337.88 |
| 06/07/2011 | 1339.22 |
| 07/07/2011 | 1353.22 |
| 08/07/2011 | 1343.8 |
| 11/07/2011 | 1319.49 |
| 12/07/2011 | 1313.64 |
| 13/07/2011 | 1317.72 |
| 14/07/2011 | 1308.87 |
| 15/07/2011 | 1316.14 |
| 18/07/2011 | 1305.44 |
| 19/07/2011 | 1326.73 |
| 20/07/2011 | 1325.84 |
| 21/07/2011 | 1343.8 |
| 22/07/2011 | 1345.02 |
| 25/07/2011 | 1337.43 |
| 26/07/2011 | 1331.94 |
| 27/07/2011 | 1304.89 |
| 28/07/2011 | 1300.67 |
| 29/07/2011 | 1292.28 |
| 01/08/2011 | 1286.94 |
| 02/08/2011 | 1254.05 |
| 03/08/2011 | 1260.34 |
| 04/08/2011 | 1200.07 |
| 05/08/2011 | 1199.38 |
| 08/08/2011 | 1119.46 |
| 09/08/2011 | 1172.53 |
| 10/08/2011 | 1120.76 |
| 11/08/2011 | 1172.64 |
| 12/08/2011 | 1178.81 |
| 15/08/2011 | 1204.49 |
| 16/08/2011 | 1192.76 |
| 17/08/2011 | 1193.89 |
| 18/08/2011 | 1140.65 |
| 19/08/2011 | 1123.53 |
| 22/08/2011 | 1123.82 |
| 23/08/2011 | 1162.35 |
| 24/08/2011 | 1177.6 |
| 25/08/2011 | 1159.27 |
| 26/08/2011 | 1176.8 |
| 29/08/2011 | 1210.08 |
| 30/08/2011 | 1212.92 |
| 31/08/2011 | 1218.89 |
| 01/09/2011 | 1204.42 |
| 02/09/2011 | 1173.97 |
| 06/09/2011 | 1165.24 |
| 07/09/2011 | 1198.62 |
| 08/09/2011 | 1185.9 |
| 09/09/2011 | 1154.23 |
| 12/09/2011 | 1162.27 |
| 13/09/2011 | 1172.87 |
| 14/09/2011 | 1188.68 |
| 15/09/2011 | 1209.11 |
| 16/09/2011 | 1216.01 |
| 19/09/2011 | 1204.09 |
| 20/09/2011 | 1202.09 |
| 21/09/2011 | 1166.76 |
| 22/09/2011 | 1129.56 |
| 23/09/2011 | 1136.43 |
| 26/09/2011 | 1162.95 |
| 27/09/2011 | 1175.38 |
| 28/09/2011 | 1151.06 |
| 29/09/2011 | 1160.4 |
| 30/09/2011 | 1131.42 |
| 03/10/2011 | 1099.23 |
| 04/10/2011 | 1123.95 |
| 05/10/2011 | 1144.03 |
| 06/10/2011 | 1164.97 |
| 07/10/2011 | 1155.46 |
| 10/10/2011 | 1194.89 |
| 11/10/2011 | 1195.54 |
| 12/10/2011 | 1207.25 |
| 13/10/2011 | 1203.66 |
| 14/10/2011 | 1224.58 |
| 17/10/2011 | 1200.86 |
| 18/10/2011 | 1225.38 |
| 19/10/2011 | 1209.88 |
| 20/10/2011 | 1215.39 |
| 21/10/2011 | 1238.25 |
| 24/10/2011 | 1254.19 |
| 25/10/2011 | 1229.05 |
| 26/10/2011 | 1242 |
| 27/10/2011 | 1284.59 |
| 28/10/2011 | 1285.09 |
| 31/10/2011 | 1253.3 |
| 01/11/2011 | 1218.28 |
| 02/11/2011 | 1237.9 |
| 03/11/2011 | 1261.15 |
| 04/11/2011 | 1253.23 |
| 07/11/2011 | 1261.12 |
| 08/11/2011 | 1275.92 |
| 09/11/2011 | 1229.1 |
| 10/11/2011 | 1239.7 |
| 11/11/2011 | 1263.85 |
| 14/11/2011 | 1251.78 |
| 15/11/2011 | 1257.81 |
| 16/11/2011 | 1236.91 |
| 17/11/2011 | 1216.13 |
| 18/11/2011 | 1215.65 |
| 21/11/2011 | 1192.98 |
| 22/11/2011 | 1188.04 |
| 23/11/2011 | 1161.79 |
| 25/11/2011 | 1158.67 |
| 28/11/2011 | 1192.55 |
| 29/11/2011 | 1195.19 |
| 30/11/2011 | 1246.96 |
| 01/12/2011 | 1244.58 |
| 02/12/2011 | 1244.28 |
| 05/12/2011 | 1257.08 |
| 06/12/2011 | 1258.47 |
| 07/12/2011 | 1261.01 |
| 08/12/2011 | 1234.35 |
| 09/12/2011 | 1255.19 |
| 12/12/2011 | 1236.47 |
| 13/12/2011 | 1225.73 |
| 14/12/2011 | 1211.82 |
| 15/12/2011 | 1215.75 |
| 16/12/2011 | 1219.66 |
| 19/12/2011 | 1205.35 |
| 20/12/2011 | 1241.3 |
| 21/12/2011 | 1243.72 |
| 22/12/2011 | 1254 |
| 23/12/2011 | 1265.33 |
| 27/12/2011 | 1265.43 |
| 28/12/2011 | 1249.64 |
| 29/12/2011 | 1263.02 |
| 30/12/2011 | 1257.6 |
| 03/01/2012 | 1277.06 |
| 04/01/2012 | 1277.3 |
| 05/01/2012 | 1281.06 |
| 06/01/2012 | 1277.81 |
| 09/01/2012 | 1280.7 |
| 10/01/2012 | 1292.08 |
| 11/01/2012 | 1292.48 |
| 12/01/2012 | 1295.5 |
| 13/01/2012 | 1289.09 |
| 17/01/2012 | 1293.67 |
| 18/01/2012 | 1308.04 |
| 19/01/2012 | 1314.5 |
| 20/01/2012 | 1315.38 |
| 23/01/2012 | 1316 |
| 24/01/2012 | 1314.65 |
| 25/01/2012 | 1326.06 |
| 26/01/2012 | 1318.43 |
| 27/01/2012 | 1316.33 |
| 30/01/2012 | 1313.01 |
| 31/01/2012 | 1312.41 |
| 01/02/2012 | 1324.09 |
| 02/02/2012 | 1325.54 |
| 03/02/2012 | 1344.9 |
| 06/02/2012 | 1344.33 |
| 07/02/2012 | 1347.05 |
| 08/02/2012 | 1349.96 |
| 09/02/2012 | 1351.95 |
| 10/02/2012 | 1342.64 |
| 13/02/2012 | 1351.77 |
| 14/02/2012 | 1350.5 |
| 15/02/2012 | 1343.23 |
| 16/02/2012 | 1358.04 |
| 17/02/2012 | 1361.23 |
| 21/02/2012 | 1362.21 |
| 22/02/2012 | 1357.66 |
| 23/02/2012 | 1363.46 |
| 24/02/2012 | 1365.74 |
| 27/02/2012 | 1367.59 |
| 28/02/2012 | 1372.18 |
| 29/02/2012 | 1365.68 |
| 01/03/2012 | 1374.09 |
| 02/03/2012 | 1369.63 |
| 05/03/2012 | 1364.33 |
| 06/03/2012 | 1343.36 |
| 07/03/2012 | 1352.63 |
| 08/03/2012 | 1365.91 |
| 09/03/2012 | 1370.87 |
| 12/03/2012 | 1371.09 |
| 13/03/2012 | 1395.95 |
| 14/03/2012 | 1394.28 |
| 15/03/2012 | 1402.6 |
| 16/03/2012 | 1404.17 |
| 19/03/2012 | 1409.75 |
| 20/03/2012 | 1405.52 |
| 21/03/2012 | 1402.89 |
| 22/03/2012 | 1392.78 |
| 23/03/2012 | 1397.11 |
| 26/03/2012 | 1416.51 |
| 27/03/2012 | 1412.52 |
| 28/03/2012 | 1405.54 |
| 29/03/2012 | 1403.28 |
| 30/03/2012 | 1408.47 |
| 02/04/2012 | 1419.04 |
| 03/04/2012 | 1413.38 |
| 04/04/2012 | 1398.96 |
| 05/04/2012 | 1398.08 |
| 09/04/2012 | 1382.2 |
| 10/04/2012 | 1358.59 |
| 11/04/2012 | 1368.71 |
| 12/04/2012 | 1387.57 |
| 13/04/2012 | 1370.26 |
| 16/04/2012 | 1369.57 |
| 17/04/2012 | 1390.78 |
| 18/04/2012 | 1385.14 |
| 19/04/2012 | 1376.92 |
| 20/04/2012 | 1378.53 |
| 23/04/2012 | 1366.94 |
| 24/04/2012 | 1371.97 |
| 25/04/2012 | 1390.69 |
| 26/04/2012 | 1399.98 |
| 27/04/2012 | 1403.36 |
| 30/04/2012 | 1397.91 |
| 01/05/2012 | 1405.82 |
| 02/05/2012 | 1402.31 |
| 03/05/2012 | 1391.57 |
| 04/05/2012 | 1369.1 |
| 07/05/2012 | 1369.58 |
| 08/05/2012 | 1363.72 |
| 09/05/2012 | 1354.58 |
| 10/05/2012 | 1357.99 |
| 11/05/2012 | 1353.39 |
| 14/05/2012 | 1338.35 |
| 15/05/2012 | 1330.66 |
| 16/05/2012 | 1324.8 |
| 17/05/2012 | 1304.86 |
| 18/05/2012 | 1295.22 |
| 21/05/2012 | 1315.99 |
| 22/05/2012 | 1316.63 |
| 23/05/2012 | 1318.86 |
| 24/05/2012 | 1320.68 |
| 25/05/2012 | 1317.82 |
| 29/05/2012 | 1332.42 |
| 30/05/2012 | 1313.32 |
| 31/05/2012 | 1310.33 |
| 01/06/2012 | 1278.04 |
| 04/06/2012 | 1278.18 |
| 05/06/2012 | 1285.5 |
| 06/06/2012 | 1315.13 |
| 07/06/2012 | 1314.99 |
| 08/06/2012 | 1325.66 |
| 11/06/2012 | 1308.93 |
| 12/06/2012 | 1324.18 |
| 13/06/2012 | 1314.88 |
| 14/06/2012 | 1329.1 |
| 15/06/2012 | 1342.84 |
| 18/06/2012 | 1344.78 |
| 19/06/2012 | 1357.98 |
| 20/06/2012 | 1355.69 |
| 21/06/2012 | 1325.51 |
| 22/06/2012 | 1335.02 |
| 25/06/2012 | 1313.72 |
| 26/06/2012 | 1319.99 |
| 27/06/2012 | 1331.85 |
| 28/06/2012 | 1329.04 |
| 29/06/2012 | 1362.16 |
| 02/07/2012 | 1365.51 |
| 03/07/2012 | 1374.02 |
| 05/07/2012 | 1367.58 |
| 06/07/2012 | 1354.68 |
| 09/07/2012 | 1352.46 |
| 10/07/2012 | 1341.47 |
| 11/07/2012 | 1341.45 |
| 12/07/2012 | 1334.76 |
| 13/07/2012 | 1356.78 |
| 16/07/2012 | 1353.64 |
| 17/07/2012 | 1363.67 |
| 18/07/2012 | 1372.78 |
| 19/07/2012 | 1376.51 |
| 20/07/2012 | 1362.66 |
| 23/07/2012 | 1350.52 |
| 24/07/2012 | 1338.31 |
| 25/07/2012 | 1337.89 |
| 26/07/2012 | 1360.02 |
| 27/07/2012 | 1385.97 |
| 30/07/2012 | 1385.3 |
| 31/07/2012 | 1379.32 |
| 01/08/2012 | 1375.32 |
| 02/08/2012 | 1365 |
| 03/08/2012 | 1390.99 |
| 06/08/2012 | 1394.23 |
| 07/08/2012 | 1401.35 |
| 08/08/2012 | 1402.22 |
| 09/08/2012 | 1402.8 |
| 10/08/2012 | 1405.87 |
| 13/08/2012 | 1404.11 |
| 14/08/2012 | 1403.93 |
| 15/08/2012 | 1405.53 |
| 16/08/2012 | 1415.51 |
| 17/08/2012 | 1418.16 |
| 20/08/2012 | 1418.13 |
| 21/08/2012 | 1413.17 |
| 22/08/2012 | 1413.49 |
| 23/08/2012 | 1402.08 |
| 24/08/2012 | 1411.13 |
| 27/08/2012 | 1410.44 |
| 28/08/2012 | 1409.3 |
| 29/08/2012 | 1410.49 |
| 30/08/2012 | 1399.48 |
| 31/08/2012 | 1406.58 |
| 04/09/2012 | 1404.94 |
| 05/09/2012 | 1403.44 |
| 06/09/2012 | 1432.12 |
| 07/09/2012 | 1437.92 |
| 10/09/2012 | 1429.08 |
| 11/09/2012 | 1433.56 |
| 12/09/2012 | 1436.56 |
| 13/09/2012 | 1459.99 |
| 14/09/2012 | 1465.77 |
| 17/09/2012 | 1461.19 |
| 18/09/2012 | 1459.32 |
| 19/09/2012 | 1461.05 |
| 20/09/2012 | 1460.26 |
| 21/09/2012 | 1460.15 |
| 24/09/2012 | 1456.89 |
| 25/09/2012 | 1441.59 |
| 26/09/2012 | 1433.32 |
| 27/09/2012 | 1447.15 |
| 28/09/2012 | 1440.67 |
| 01/10/2012 | 1444.49 |
| 02/10/2012 | 1445.75 |
| 03/10/2012 | 1450.99 |
| 04/10/2012 | 1461.4 |
| 05/10/2012 | 1460.93 |
| 08/10/2012 | 1455.88 |
| 09/10/2012 | 1441.48 |
| 10/10/2012 | 1432.56 |
| 11/10/2012 | 1432.84 |
| 12/10/2012 | 1428.59 |
| 15/10/2012 | 1440.13 |
| 16/10/2012 | 1454.92 |
| 17/10/2012 | 1460.91 |
| 18/10/2012 | 1457.34 |
| 19/10/2012 | 1433.19 |
| 22/10/2012 | 1433.82 |
| 23/10/2012 | 1413.11 |
| 24/10/2012 | 1408.75 |
| 25/10/2012 | 1412.97 |
| 26/10/2012 | 1411.94 |
| 31/10/2012 | 1412.16 |
| 01/11/2012 | 1427.59 |
| 02/11/2012 | 1414.2 |
| 05/11/2012 | 1417.26 |
| 06/11/2012 | 1428.39 |
| 07/11/2012 | 1394.53 |
| 08/11/2012 | 1377.51 |
| 09/11/2012 | 1379.85 |
| 12/11/2012 | 1380.03 |
| 13/11/2012 | 1374.53 |
| 14/11/2012 | 1355.49 |
| 15/11/2012 | 1353.33 |
| 16/11/2012 | 1359.88 |
| 19/11/2012 | 1386.89 |
| 20/11/2012 | 1387.81 |
| 21/11/2012 | 1391.03 |
| 23/11/2012 | 1409.15 |
| 26/11/2012 | 1406.29 |
| 27/11/2012 | 1398.94 |
| 28/11/2012 | 1409.93 |
| 29/11/2012 | 1415.95 |
| 30/11/2012 | 1416.18 |
| 03/12/2012 | 1409.46 |
| 04/12/2012 | 1407.05 |
| 05/12/2012 | 1409.28 |
| 06/12/2012 | 1413.94 |
| 07/12/2012 | 1418.07 |
| 10/12/2012 | 1418.55 |
| 11/12/2012 | 1427.84 |
| 12/12/2012 | 1428.48 |
| 13/12/2012 | 1419.45 |
| 14/12/2012 | 1413.58 |
| 17/12/2012 | 1430.36 |
| 18/12/2012 | 1446.79 |
| 19/12/2012 | 1435.81 |
| 20/12/2012 | 1443.69 |
| 21/12/2012 | 1430.15 |
| 24/12/2012 | 1426.66 |
| 26/12/2012 | 1419.83 |
| 27/12/2012 | 1418.1 |
| 28/12/2012 | 1402.43 |
| 31/12/2012 | 1426.19 |
| 02/01/2013 | 1462.42 |
| 03/01/2013 | 1459.37 |
| 04/01/2013 | 1466.47 |
| 07/01/2013 | 1461.89 |
| 08/01/2013 | 1457.15 |
| 09/01/2013 | 1461.02 |
| 10/01/2013 | 1472.12 |
| 11/01/2013 | 1472.05 |
| 14/01/2013 | 1470.68 |
| 15/01/2013 | 1472.34 |
| 16/01/2013 | 1472.63 |
| 17/01/2013 | 1480.94 |
| 18/01/2013 | 1485.98 |
| 22/01/2013 | 1492.56 |
| 23/01/2013 | 1494.81 |
| 24/01/2013 | 1494.82 |
| 25/01/2013 | 1502.96 |
| 28/01/2013 | 1500.18 |
| 29/01/2013 | 1507.84 |
| 30/01/2013 | 1501.96 |
| 31/01/2013 | 1498.11 |
| 01/02/2013 | 1513.17 |
| 04/02/2013 | 1495.71 |
| 05/02/2013 | 1511.29 |
| 06/02/2013 | 1512.12 |
| 07/02/2013 | 1509.39 |
| 08/02/2013 | 1517.93 |
| 11/02/2013 | 1517.01 |
| 12/02/2013 | 1519.43 |
| 13/02/2013 | 1520.33 |
| 14/02/2013 | 1521.38 |
| 15/02/2013 | 1519.79 |
| 19/02/2013 | 1530.94 |
| 20/02/2013 | 1511.95 |
| 21/02/2013 | 1502.42 |
| 22/02/2013 | 1515.6 |
| 25/02/2013 | 1487.85 |
| 26/02/2013 | 1496.94 |
| 27/02/2013 | 1515.99 |
| 28/02/2013 | 1514.68 |
| 01/03/2013 | 1518.2 |
| 04/03/2013 | 1525.2 |
| 05/03/2013 | 1539.79 |
| 06/03/2013 | 1541.46 |
| 07/03/2013 | 1544.26 |
| 08/03/2013 | 1551.18 |
| 11/03/2013 | 1556.22 |
| 12/03/2013 | 1552.48 |
| 13/03/2013 | 1554.52 |
| 14/03/2013 | 1563.23 |
| 15/03/2013 | 1560.7 |
| 18/03/2013 | 1552.1 |
| 19/03/2013 | 1548.34 |
| 20/03/2013 | 1558.71 |
| 21/03/2013 | 1545.8 |
| 22/03/2013 | 1556.89 |
| 25/03/2013 | 1551.69 |
| 26/03/2013 | 1563.77 |
| 27/03/2013 | 1562.85 |
| 28/03/2013 | 1569.19 |
| 01/04/2013 | 1562.17 |
| 02/04/2013 | 1570.25 |
| 03/04/2013 | 1553.69 |
| 04/04/2013 | 1559.98 |
| 05/04/2013 | 1553.28 |
| 08/04/2013 | 1563.07 |
| 09/04/2013 | 1568.61 |
| 10/04/2013 | 1587.73 |
| 11/04/2013 | 1593.37 |
| 12/04/2013 | 1588.85 |
| 15/04/2013 | 1552.36 |
| 16/04/2013 | 1574.57 |
| 17/04/2013 | 1552.01 |
| 18/04/2013 | 1541.61 |
| 19/04/2013 | 1555.25 |
| 22/04/2013 | 1562.5 |
| 23/04/2013 | 1578.78 |
| 24/04/2013 | 1578.79 |
| 25/04/2013 | 1585.16 |
| 26/04/2013 | 1582.24 |
| 29/04/2013 | 1593.61 |
| 30/04/2013 | 1597.57 |
| 01/05/2013 | 1582.7 |
| 02/05/2013 | 1597.59 |
| 03/05/2013 | 1614.42 |
| 06/05/2013 | 1617.5 |
| 07/05/2013 | 1625.96 |
| 08/05/2013 | 1632.69 |
| 09/05/2013 | 1626.67 |
| 10/05/2013 | 1633.7 |
| 13/05/2013 | 1633.77 |
| 14/05/2013 | 1650.34 |
| 15/05/2013 | 1658.78 |
| 16/05/2013 | 1650.47 |
| 17/05/2013 | 1667.47 |
| 20/05/2013 | 1666.29 |
| 21/05/2013 | 1669.16 |
| 22/05/2013 | 1655.35 |
| 23/05/2013 | 1650.51 |
| 24/05/2013 | 1649.6 |
| 28/05/2013 | 1660.06 |
| 29/05/2013 | 1648.36 |
| 30/05/2013 | 1654.41 |
| 31/05/2013 | 1630.74 |
| 03/06/2013 | 1640.42 |
| 04/06/2013 | 1631.38 |
| 05/06/2013 | 1608.9 |
| 06/06/2013 | 1622.56 |
| 07/06/2013 | 1643.38 |
| 10/06/2013 | 1642.81 |
| 11/06/2013 | 1626.13 |
| 12/06/2013 | 1612.52 |
| 13/06/2013 | 1636.36 |
| 14/06/2013 | 1626.73 |
| 17/06/2013 | 1639.04 |
| 18/06/2013 | 1651.81 |
| 19/06/2013 | 1628.93 |
| 20/06/2013 | 1588.19 |
| 21/06/2013 | 1592.43 |
| 24/06/2013 | 1573.09 |
| 25/06/2013 | 1588.03 |
| 26/06/2013 | 1603.26 |
| 27/06/2013 | 1613.2 |
| 28/06/2013 | 1606.28 |
| 01/07/2013 | 1614.96 |
| 02/07/2013 | 1614.08 |
| 03/07/2013 | 1615.41 |
| 05/07/2013 | 1631.89 |
| 08/07/2013 | 1640.46 |
| 09/07/2013 | 1652.32 |
| 10/07/2013 | 1652.62 |
| 11/07/2013 | 1675.02 |
| 12/07/2013 | 1680.19 |
| 15/07/2013 | 1682.5 |
| 16/07/2013 | 1676.26 |
| 17/07/2013 | 1680.91 |
| 18/07/2013 | 1689.37 |
| 19/07/2013 | 1692.09 |
| 22/07/2013 | 1695.53 |
| 23/07/2013 | 1692.39 |
| 24/07/2013 | 1685.94 |
| 25/07/2013 | 1690.25 |
| 26/07/2013 | 1691.65 |
| 29/07/2013 | 1685.33 |
| 30/07/2013 | 1685.96 |
| 31/07/2013 | 1685.73 |
| 01/08/2013 | 1706.87 |
| 02/08/2013 | 1709.67 |
| 05/08/2013 | 1707.14 |
| 06/08/2013 | 1697.37 |
| 07/08/2013 | 1690.91 |
| 08/08/2013 | 1697.48 |
| 09/08/2013 | 1691.42 |
| 12/08/2013 | 1689.47 |
| 13/08/2013 | 1694.16 |
| 14/08/2013 | 1685.39 |
| 15/08/2013 | 1661.32 |
| 16/08/2013 | 1655.83 |
| 19/08/2013 | 1646.06 |
| 20/08/2013 | 1652.35 |
| 21/08/2013 | 1642.8 |
| 22/08/2013 | 1656.96 |
| 23/08/2013 | 1663.5 |
| 26/08/2013 | 1656.78 |
| 27/08/2013 | 1630.48 |
| 28/08/2013 | 1634.96 |
| 29/08/2013 | 1638.17 |
| 30/08/2013 | 1632.97 |
| 03/09/2013 | 1639.77 |
| 04/09/2013 | 1653.08 |
| 05/09/2013 | 1655.08 |
| 06/09/2013 | 1655.17 |
| 09/09/2013 | 1671.71 |
| 10/09/2013 | 1683.99 |
| 11/09/2013 | 1689.13 |
| 12/09/2013 | 1683.42 |
| 13/09/2013 | 1687.99 |
| 16/09/2013 | 1697.6 |
| 17/09/2013 | 1704.76 |
| 18/09/2013 | 1725.52 |
| 19/09/2013 | 1722.34 |
| 20/09/2013 | 1709.91 |
| 23/09/2013 | 1701.84 |
| 24/09/2013 | 1697.42 |
| 25/09/2013 | 1692.77 |
| 26/09/2013 | 1698.67 |
| 27/09/2013 | 1691.75 |
| 30/09/2013 | 1681.55 |
| 01/10/2013 | 1695 |
| 02/10/2013 | 1693.87 |
| 03/10/2013 | 1678.66 |
| 04/10/2013 | 1690.5 |
| 07/10/2013 | 1676.12 |
| 08/10/2013 | 1655.45 |
| 09/10/2013 | 1656.4 |
| 10/10/2013 | 1692.56 |
| 11/10/2013 | 1703.2 |
| 14/10/2013 | 1710.14 |
| 15/10/2013 | 1698.06 |
| 16/10/2013 | 1721.54 |
| 17/10/2013 | 1733.15 |
| 18/10/2013 | 1744.5 |
| 21/10/2013 | 1744.66 |
| 22/10/2013 | 1754.67 |
| 23/10/2013 | 1746.38 |
| 24/10/2013 | 1752.07 |
| 25/10/2013 | 1759.77 |
| 28/10/2013 | 1762.11 |
| 29/10/2013 | 1771.95 |
| 30/10/2013 | 1763.31 |
| 31/10/2013 | 1756.54 |
| 01/11/2013 | 1761.64 |
| 04/11/2013 | 1767.93 |
| 05/11/2013 | 1762.97 |
| 06/11/2013 | 1770.49 |
| 07/11/2013 | 1747.15 |
| 08/11/2013 | 1770.61 |
| 11/11/2013 | 1771.89 |
| 12/11/2013 | 1767.69 |
| 13/11/2013 | 1782 |
| 14/11/2013 | 1790.62 |
| 15/11/2013 | 1798.18 |
| 18/11/2013 | 1791.53 |
| 19/11/2013 | 1787.87 |
| 20/11/2013 | 1781.37 |
| 21/11/2013 | 1795.85 |
| 22/11/2013 | 1804.76 |
| 25/11/2013 | 1802.48 |
| 26/11/2013 | 1802.75 |
| 27/11/2013 | 1807.23 |
| 29/11/2013 | 1805.81 |
| 02/12/2013 | 1800.9 |
| 03/12/2013 | 1795.15 |
| 04/12/2013 | 1792.81 |
| 05/12/2013 | 1785.03 |
| 06/12/2013 | 1805.09 |
| 09/12/2013 | 1808.37 |
| 10/12/2013 | 1802.62 |
| 11/12/2013 | 1782.22 |
| 12/12/2013 | 1775.5 |
| 13/12/2013 | 1775.32 |
| 16/12/2013 | 1786.54 |
| 17/12/2013 | 1781 |
| 18/12/2013 | 1810.65 |
| 19/12/2013 | 1809.6 |
| 20/12/2013 | 1818.32 |
| 23/12/2013 | 1827.99 |
| 24/12/2013 | 1833.32 |
| 26/12/2013 | 1842.02 |
| 27/12/2013 | 1841.4 |
| 30/12/2013 | 1841.07 |
| 31/12/2013 | 1848.36 |
| 02/01/2014 | 1831.98 |
| 03/01/2014 | 1831.37 |
| 06/01/2014 | 1826.77 |
| 07/01/2014 | 1837.88 |
| 08/01/2014 | 1837.49 |
| 09/01/2014 | 1838.13 |
| 10/01/2014 | 1842.37 |
| 13/01/2014 | 1819.2 |
| 14/01/2014 | 1838.88 |
| 15/01/2014 | 1848.38 |
| 16/01/2014 | 1845.89 |
| 17/01/2014 | 1838.7 |
| 21/01/2014 | 1843.8 |
| 22/01/2014 | 1844.86 |
| 23/01/2014 | 1828.46 |
| 24/01/2014 | 1790.29 |
| 27/01/2014 | 1781.56 |
| 28/01/2014 | 1792.5 |
| 29/01/2014 | 1774.2 |
| 30/01/2014 | 1794.19 |
| 31/01/2014 | 1782.59 |
| 03/02/2014 | 1741.89 |
| 04/02/2014 | 1755.2 |
| 05/02/2014 | 1751.64 |
| 06/02/2014 | 1773.43 |
| 07/02/2014 | 1797.02 |
| 10/02/2014 | 1799.84 |
| 11/02/2014 | 1819.75 |
| 12/02/2014 | 1819.26 |
| 13/02/2014 | 1829.83 |
| 14/02/2014 | 1838.63 |
| 18/02/2014 | 1840.76 |
| 19/02/2014 | 1828.75 |
| 20/02/2014 | 1839.78 |
| 21/02/2014 | 1836.25 |
| 24/02/2014 | 1847.61 |
| 25/02/2014 | 1845.12 |
| 26/02/2014 | 1845.16 |
| 27/02/2014 | 1854.29 |
| 28/02/2014 | 1859.45 |
| 03/03/2014 | 1845.73 |
| 04/03/2014 | 1873.91 |
| 05/03/2014 | 1873.81 |
| 06/03/2014 | 1877.03 |
| 07/03/2014 | 1878.04 |
| 10/03/2014 | 1877.17 |
| 11/03/2014 | 1867.63 |
| 12/03/2014 | 1868.2 |
| 13/03/2014 | 1846.34 |
| 14/03/2014 | 1841.13 |
| 17/03/2014 | 1858.83 |
| 18/03/2014 | 1872.25 |
| 19/03/2014 | 1860.77 |
| 20/03/2014 | 1872.01 |
| 21/03/2014 | 1866.52 |
| 24/03/2014 | 1857.44 |
| 25/03/2014 | 1865.62 |
| 26/03/2014 | 1852.56 |
| 27/03/2014 | 1849.04 |
| 28/03/2014 | 1857.62 |
| 31/03/2014 | 1872.34 |
| 01/04/2014 | 1885.52 |
| 02/04/2014 | 1890.9 |
| 03/04/2014 | 1888.77 |
| 04/04/2014 | 1865.09 |
| 07/04/2014 | 1845.04 |
| 08/04/2014 | 1851.96 |
| 09/04/2014 | 1872.18 |
| 10/04/2014 | 1833.08 |
| 11/04/2014 | 1815.69 |
| 14/04/2014 | 1830.61 |
| 15/04/2014 | 1842.98 |
| 16/04/2014 | 1862.31 |
| 17/04/2014 | 1864.85 |
| 21/04/2014 | 1871.89 |
| 22/04/2014 | 1879.55 |
| 23/04/2014 | 1875.39 |
| 24/04/2014 | 1878.61 |
| 25/04/2014 | 1863.4 |
| 28/04/2014 | 1869.43 |
| 29/04/2014 | 1878.33 |
| 30/04/2014 | 1883.95 |
| 01/05/2014 | 1883.68 |
| 02/05/2014 | 1881.14 |
| 05/05/2014 | 1884.66 |
| 06/05/2014 | 1867.72 |
| 07/05/2014 | 1878.21 |
| 08/05/2014 | 1875.63 |
| 09/05/2014 | 1878.48 |
| 12/05/2014 | 1896.65 |
| 13/05/2014 | 1897.45 |
| 14/05/2014 | 1888.53 |
| 15/05/2014 | 1870.85 |
| 16/05/2014 | 1877.86 |
| 19/05/2014 | 1885.08 |
| 20/05/2014 | 1872.83 |
| 21/05/2014 | 1888.03 |
| 22/05/2014 | 1892.49 |
| 23/05/2014 | 1900.53 |
| 27/05/2014 | 1911.91 |
| 28/05/2014 | 1909.78 |
| 29/05/2014 | 1920.03 |
| 30/05/2014 | 1923.57 |
| 02/06/2014 | 1924.97 |
| 03/06/2014 | 1924.24 |
| 04/06/2014 | 1927.88 |
| 05/06/2014 | 1940.46 |
| 06/06/2014 | 1949.44 |
| 09/06/2014 | 1951.27 |
| 10/06/2014 | 1950.79 |
| 11/06/2014 | 1943.89 |
| 12/06/2014 | 1930.11 |
| 13/06/2014 | 1936.16 |
| 16/06/2014 | 1937.78 |
| 17/06/2014 | 1941.99 |
| 18/06/2014 | 1956.98 |
| 19/06/2014 | 1959.48 |
| 20/06/2014 | 1962.87 |
| 23/06/2014 | 1962.61 |
| 24/06/2014 | 1949.98 |
| 25/06/2014 | 1959.53 |
| 26/06/2014 | 1957.22 |
| 27/06/2014 | 1960.96 |
| 30/06/2014 | 1960.23 |
| 01/07/2014 | 1973.32 |
| 02/07/2014 | 1974.62 |
| 03/07/2014 | 1985.44 |
| 07/07/2014 | 1977.65 |
| 08/07/2014 | 1963.71 |
| 09/07/2014 | 1972.83 |
| 10/07/2014 | 1964.68 |
| 11/07/2014 | 1967.57 |
| 14/07/2014 | 1977.1 |
| 15/07/2014 | 1973.28 |
| 16/07/2014 | 1981.57 |
| 17/07/2014 | 1958.12 |
| 18/07/2014 | 1978.22 |
| 21/07/2014 | 1973.63 |
| 22/07/2014 | 1983.53 |
| 23/07/2014 | 1987.01 |
| 24/07/2014 | 1987.98 |
| 25/07/2014 | 1978.34 |
| 28/07/2014 | 1978.91 |
| 29/07/2014 | 1969.95 |
| 30/07/2014 | 1970.07 |
| 31/07/2014 | 1930.67 |
| 01/08/2014 | 1925.15 |
| 04/08/2014 | 1938.99 |
| 05/08/2014 | 1920.21 |
| 06/08/2014 | 1920.24 |
| 07/08/2014 | 1909.57 |
| 08/08/2014 | 1931.59 |
| 11/08/2014 | 1936.92 |
| 12/08/2014 | 1933.75 |
| 13/08/2014 | 1946.72 |
| 14/08/2014 | 1955.18 |
| 15/08/2014 | 1955.06 |
| 18/08/2014 | 1971.74 |
| 19/08/2014 | 1981.6 |
| 20/08/2014 | 1986.51 |
| 21/08/2014 | 1992.37 |
| 22/08/2014 | 1988.4 |
| 25/08/2014 | 1997.92 |
| 26/08/2014 | 2000.02 |
| 27/08/2014 | 2000.12 |
| 28/08/2014 | 1996.74 |
| 29/08/2014 | 2003.37 |
| 02/09/2014 | 2002.28 |
| 03/09/2014 | 2000.72 |
| 04/09/2014 | 1997.65 |
| 05/09/2014 | 2007.71 |
| 08/09/2014 | 2001.54 |
| 09/09/2014 | 1988.44 |
| 10/09/2014 | 1995.69 |
| 11/09/2014 | 1997.45 |
| 12/09/2014 | 1985.54 |
| 15/09/2014 | 1984.13 |
| 16/09/2014 | 1998.98 |
| 17/09/2014 | 2001.57 |
| 18/09/2014 | 2011.36 |
| 19/09/2014 | 2010.4 |
| 22/09/2014 | 1994.29 |
| 23/09/2014 | 1982.77 |
| 24/09/2014 | 1998.3 |
| 25/09/2014 | 1965.99 |
| 26/09/2014 | 1982.85 |
| 29/09/2014 | 1977.8 |
| 30/09/2014 | 1972.29 |
| 01/10/2014 | 1946.16 |
| 02/10/2014 | 1946.17 |
| 03/10/2014 | 1967.9 |
| 06/10/2014 | 1964.82 |
| 07/10/2014 | 1935.1 |
| 08/10/2014 | 1968.89 |
| 09/10/2014 | 1928.21 |
| 10/10/2014 | 1906.13 |
| 13/10/2014 | 1874.74 |
| 14/10/2014 | 1877.7 |
| 15/10/2014 | 1862.49 |
| 16/10/2014 | 1862.76 |
| 17/10/2014 | 1886.76 |
| 20/10/2014 | 1904.01 |
| 21/10/2014 | 1941.28 |
| 22/10/2014 | 1927.11 |
| 23/10/2014 | 1950.82 |
| 24/10/2014 | 1964.58 |
| 27/10/2014 | 1961.63 |
| 28/10/2014 | 1985.05 |
| 29/10/2014 | 1982.3 |
| 30/10/2014 | 1994.65 |
| 31/10/2014 | 2018.05 |
| 03/11/2014 | 2017.81 |
| 04/11/2014 | 2012.1 |
| 05/11/2014 | 2023.57 |
| 06/11/2014 | 2031.21 |
| 07/11/2014 | 2031.92 |
| 10/11/2014 | 2038.26 |
| 11/11/2014 | 2039.68 |
| 12/11/2014 | 2038.25 |
| 13/11/2014 | 2039.33 |
| 14/11/2014 | 2039.82 |
| 17/11/2014 | 2041.32 |
| 18/11/2014 | 2051.8 |
| 19/11/2014 | 2048.72 |
| 20/11/2014 | 2052.75 |
| 21/11/2014 | 2063.5 |
| 24/11/2014 | 2069.41 |
| 25/11/2014 | 2067.03 |
| 26/11/2014 | 2072.83 |
| 28/11/2014 | 2067.56 |
| 01/12/2014 | 2053.44 |
| 02/12/2014 | 2066.55 |
| 03/12/2014 | 2074.33 |
| 04/12/2014 | 2071.92 |
| 05/12/2014 | 2075.37 |
| 08/12/2014 | 2060.31 |
| 09/12/2014 | 2059.82 |
| 10/12/2014 | 2026.14 |
| 11/12/2014 | 2035.33 |
| 12/12/2014 | 2002.33 |
| 15/12/2014 | 1989.63 |
| 16/12/2014 | 1972.74 |
| 17/12/2014 | 2012.89 |
| 18/12/2014 | 2061.23 |
| 19/12/2014 | 2070.65 |
| 22/12/2014 | 2078.54 |
| 23/12/2014 | 2082.17 |
| 24/12/2014 | 2081.88 |
| 26/12/2014 | 2088.77 |
| 29/12/2014 | 2090.57 |
| 30/12/2014 | 2080.35 |
| 31/12/2014 | 2058.9 |
| 02/01/2015 | 2058.2 |
| 05/01/2015 | 2020.58 |
| 06/01/2015 | 2002.61 |
| 07/01/2015 | 2025.9 |
| 08/01/2015 | 2062.14 |
| 09/01/2015 | 2044.81 |
| 12/01/2015 | 2028.26 |
| 13/01/2015 | 2023.03 |
| 14/01/2015 | 2011.27 |
| 15/01/2015 | 1992.67 |
| 16/01/2015 | 2019.42 |
| 20/01/2015 | 2022.55 |
| 21/01/2015 | 2032.12 |
| 22/01/2015 | 2063.15 |
| 23/01/2015 | 2051.82 |
| 26/01/2015 | 2057.09 |
| 27/01/2015 | 2029.55 |
| 28/01/2015 | 2002.16 |
| 29/01/2015 | 2021.25 |
| 30/01/2015 | 1994.99 |
| 02/02/2015 | 2020.85 |
| 03/02/2015 | 2050.03 |
| 04/02/2015 | 2041.51 |
| 05/02/2015 | 2062.52 |
| 06/02/2015 | 2055.47 |
| 09/02/2015 | 2046.74 |
| 10/02/2015 | 2068.59 |
| 11/02/2015 | 2068.53 |
| 12/02/2015 | 2088.48 |
| 13/02/2015 | 2096.99 |
| 17/02/2015 | 2100.34 |
| 18/02/2015 | 2099.68 |
| 19/02/2015 | 2097.45 |
| 20/02/2015 | 2110.3 |
| 23/02/2015 | 2109.66 |
| 24/02/2015 | 2115.48 |
| 25/02/2015 | 2113.86 |
| 26/02/2015 | 2110.74 |
| 27/02/2015 | 2104.5 |
| 02/03/2015 | 2117.39 |
| 03/03/2015 | 2107.78 |
| 04/03/2015 | 2098.53 |
| 05/03/2015 | 2101.04 |
| 06/03/2015 | 2071.26 |
| 09/03/2015 | 2079.43 |
| 10/03/2015 | 2044.16 |
| 11/03/2015 | 2040.24 |
| 12/03/2015 | 2065.95 |
| 13/03/2015 | 2053.4 |
| 16/03/2015 | 2081.19 |
| 17/03/2015 | 2074.28 |
| 18/03/2015 | 2099.5 |
| 19/03/2015 | 2089.27 |
| 20/03/2015 | 2108.1 |
| 23/03/2015 | 2104.42 |
| 24/03/2015 | 2091.5 |
| 25/03/2015 | 2061.05 |
| 26/03/2015 | 2056.15 |
| 27/03/2015 | 2061.02 |
| 30/03/2015 | 2086.24 |
| 31/03/2015 | 2067.89 |
| 01/04/2015 | 2059.69 |
| 02/04/2015 | 2066.96 |
| 06/04/2015 | 2080.62 |
| 07/04/2015 | 2076.33 |
| 08/04/2015 | 2081.9 |
| 09/04/2015 | 2091.18 |
| 10/04/2015 | 2102.06 |
| 13/04/2015 | 2092.43 |
| 14/04/2015 | 2095.84 |
| 15/04/2015 | 2106.63 |
| 16/04/2015 | 2104.99 |
| 17/04/2015 | 2081.18 |
| 20/04/2015 | 2100.4 |
| 21/04/2015 | 2097.29 |
| 22/04/2015 | 2107.96 |
| 23/04/2015 | 2112.93 |
| 24/04/2015 | 2117.69 |
| 27/04/2015 | 2108.92 |
| 28/04/2015 | 2114.76 |
| 29/04/2015 | 2106.85 |
| 30/04/2015 | 2085.51 |
| 01/05/2015 | 2108.29 |
| 04/05/2015 | 2114.49 |
| 05/05/2015 | 2089.46 |
| 06/05/2015 | 2080.15 |
| 07/05/2015 | 2088 |
| 08/05/2015 | 2116.1 |
| 11/05/2015 | 2105.33 |
| 12/05/2015 | 2099.12 |
| 13/05/2015 | 2098.48 |
| 14/05/2015 | 2121.1 |
| 15/05/2015 | 2122.73 |
| 18/05/2015 | 2129.2 |
| 19/05/2015 | 2127.83 |
| 20/05/2015 | 2125.85 |
| 21/05/2015 | 2130.82 |
| 22/05/2015 | 2126.06 |
| 26/05/2015 | 2104.2 |
| 27/05/2015 | 2123.48 |
| 28/05/2015 | 2120.79 |
| 29/05/2015 | 2107.39 |
| 01/06/2015 | 2111.73 |
| 02/06/2015 | 2109.6 |
| 03/06/2015 | 2114.07 |
| 04/06/2015 | 2095.84 |
| 05/06/2015 | 2092.83 |
| 08/06/2015 | 2079.28 |
| 09/06/2015 | 2080.15 |
| 10/06/2015 | 2105.2 |
| 11/06/2015 | 2108.86 |
| 12/06/2015 | 2094.11 |
| 15/06/2015 | 2084.43 |
| 16/06/2015 | 2096.29 |
| 17/06/2015 | 2100.44 |
| 18/06/2015 | 2121.24 |
| 19/06/2015 | 2109.99 |
| 22/06/2015 | 2122.85 |
| 23/06/2015 | 2124.2 |
| 24/06/2015 | 2108.58 |
| 25/06/2015 | 2102.31 |
| 26/06/2015 | 2101.49 |
| 29/06/2015 | 2057.64 |
| 30/06/2015 | 2063.11 |
| 01/07/2015 | 2077.42 |
| 02/07/2015 | 2076.78 |
| 06/07/2015 | 2068.76 |
| 07/07/2015 | 2081.34 |
| 08/07/2015 | 2046.68 |
| 09/07/2015 | 2051.31 |
| 10/07/2015 | 2076.62 |
| 13/07/2015 | 2099.6 |
| 14/07/2015 | 2108.95 |
| 15/07/2015 | 2107.4 |
| 16/07/2015 | 2124.29 |
| 17/07/2015 | 2126.64 |
| 20/07/2015 | 2128.28 |
| 21/07/2015 | 2119.21 |
| 22/07/2015 | 2114.15 |
| 23/07/2015 | 2102.15 |
| 24/07/2015 | 2079.65 |
| 27/07/2015 | 2067.64 |
| 28/07/2015 | 2093.25 |
| 29/07/2015 | 2108.57 |
| 30/07/2015 | 2108.63 |
| 31/07/2015 | 2103.84 |
| 03/08/2015 | 2098.04 |
| 04/08/2015 | 2093.32 |
| 05/08/2015 | 2099.84 |
| 06/08/2015 | 2083.56 |
| 07/08/2015 | 2077.57 |
| 10/08/2015 | 2104.18 |
| 11/08/2015 | 2084.07 |
| 12/08/2015 | 2086.05 |
| 13/08/2015 | 2083.39 |
| 14/08/2015 | 2091.54 |
| 17/08/2015 | 2102.44 |
| 18/08/2015 | 2096.92 |
| 19/08/2015 | 2079.61 |
| 20/08/2015 | 2035.73 |
| 21/08/2015 | 1970.89 |
| 24/08/2015 | 1893.21 |
| 25/08/2015 | 1867.61 |
| 26/08/2015 | 1940.51 |
| 27/08/2015 | 1987.66 |
| 28/08/2015 | 1988.87 |
| 31/08/2015 | 1972.18 |
| 01/09/2015 | 1913.85 |
| 02/09/2015 | 1948.86 |
| 03/09/2015 | 1951.13 |
| 04/09/2015 | 1921.22 |
| 08/09/2015 | 1969.41 |
| 09/09/2015 | 1942.04 |
| 10/09/2015 | 1952.29 |
| 11/09/2015 | 1961.05 |
| 14/09/2015 | 1953.03 |
| 15/09/2015 | 1978.09 |
| 16/09/2015 | 1995.31 |
| 17/09/2015 | 1990.2 |
| 18/09/2015 | 1958.03 |
| 21/09/2015 | 1966.97 |
| 22/09/2015 | 1942.74 |
| 23/09/2015 | 1938.76 |
| 24/09/2015 | 1932.24 |
| 25/09/2015 | 1931.34 |
| 28/09/2015 | 1881.77 |
| 29/09/2015 | 1884.09 |
| 30/09/2015 | 1920.03 |
| 01/10/2015 | 1923.82 |
| 02/10/2015 | 1951.36 |
| 05/10/2015 | 1987.05 |
| 06/10/2015 | 1979.92 |
| 07/10/2015 | 1995.83 |
| 08/10/2015 | 2013.43 |
| 09/10/2015 | 2014.89 |
| 12/10/2015 | 2017.46 |
| 13/10/2015 | 2003.69 |
| 14/10/2015 | 1994.24 |
| 15/10/2015 | 2023.86 |
| 16/10/2015 | 2033.11 |
| 19/10/2015 | 2033.66 |
| 20/10/2015 | 2030.77 |
| 21/10/2015 | 2018.94 |
| 22/10/2015 | 2052.51 |
| 23/10/2015 | 2075.15 |
| 26/10/2015 | 2071.18 |
| 27/10/2015 | 2065.89 |
| 28/10/2015 | 2090.35 |
| 29/10/2015 | 2089.41 |
| 30/10/2015 | 2079.36 |
| 02/11/2015 | 2104.05 |
| 03/11/2015 | 2109.79 |
| 04/11/2015 | 2102.31 |
| 05/11/2015 | 2099.93 |
| 06/11/2015 | 2099.2 |
| 09/11/2015 | 2078.58 |
| 10/11/2015 | 2081.72 |
| 11/11/2015 | 2075 |
| 12/11/2015 | 2045.97 |
| 13/11/2015 | 2023.04 |
| 16/11/2015 | 2053.19 |
| 17/11/2015 | 2050.44 |
| 18/11/2015 | 2083.58 |
| 19/11/2015 | 2081.24 |
| 20/11/2015 | 2089.17 |
| 23/11/2015 | 2086.59 |
| 24/11/2015 | 2089.14 |
| 25/11/2015 | 2088.87 |
| 27/11/2015 | 2090.11 |
| 30/11/2015 | 2080.41 |
| 01/12/2015 | 2102.63 |
| 02/12/2015 | 2079.51 |
| 03/12/2015 | 2049.62 |
| 04/12/2015 | 2091.69 |
| 07/12/2015 | 2077.07 |
| 08/12/2015 | 2063.59 |
| 09/12/2015 | 2047.62 |
| 10/12/2015 | 2052.23 |
| 11/12/2015 | 2012.37 |
| 14/12/2015 | 2021.94 |
| 15/12/2015 | 2043.41 |
| 16/12/2015 | 2073.07 |
| 17/12/2015 | 2041.89 |
| 18/12/2015 | 2005.55 |
| 21/12/2015 | 2021.15 |
| 22/12/2015 | 2038.97 |
| 23/12/2015 | 2064.29 |
| 24/12/2015 | 2060.99 |
| 28/12/2015 | 2056.5 |
| 29/12/2015 | 2078.36 |
| 30/12/2015 | 2063.36 |
| 31/12/2015 | 2043.94 |
| 04/01/2016 | 2012.66 |
| 05/01/2016 | 2016.71 |
| 06/01/2016 | 1990.26 |
| 07/01/2016 | 1943.09 |
| 08/01/2016 | 1922.03 |
| 11/01/2016 | 1923.67 |
| 12/01/2016 | 1938.68 |
| 13/01/2016 | 1890.28 |
| 14/01/2016 | 1921.84 |
| 15/01/2016 | 1880.33 |
| 19/01/2016 | 1881.33 |
| 20/01/2016 | 1859.33 |
| 21/01/2016 | 1868.99 |
| 22/01/2016 | 1906.9 |
| 25/01/2016 | 1877.08 |
| 26/01/2016 | 1903.63 |
| 27/01/2016 | 1882.95 |
| 28/01/2016 | 1893.36 |
| 29/01/2016 | 1940.24 |
| 01/02/2016 | 1939.38 |
| 02/02/2016 | 1903.03 |
| 03/02/2016 | 1912.53 |
| 04/02/2016 | 1915.45 |
| 05/02/2016 | 1880.05 |
| 08/02/2016 | 1853.44 |
| 09/02/2016 | 1852.21 |
| 10/02/2016 | 1851.86 |
| 11/02/2016 | 1829.08 |
| 12/02/2016 | 1864.78 |
| 16/02/2016 | 1895.58 |
| 17/02/2016 | 1926.82 |
| 18/02/2016 | 1917.83 |
| 19/02/2016 | 1917.78 |
| 22/02/2016 | 1945.5 |
| 23/02/2016 | 1921.27 |
| 24/02/2016 | 1929.8 |
| 25/02/2016 | 1951.7 |
| 26/02/2016 | 1948.05 |
| 29/02/2016 | 1932.23 |
| 01/03/2016 | 1978.35 |
| 02/03/2016 | 1986.45 |
| 03/03/2016 | 1993.4 |
| 04/03/2016 | 1999.99 |
| 07/03/2016 | 2001.76 |
| 08/03/2016 | 1979.26 |
| 09/03/2016 | 1989.26 |
| 10/03/2016 | 1989.57 |
| 11/03/2016 | 2022.19 |
| 14/03/2016 | 2019.64 |
| 15/03/2016 | 2015.93 |
| 16/03/2016 | 2027.22 |
| 17/03/2016 | 2040.59 |
| 18/03/2016 | 2049.58 |
| 21/03/2016 | 2051.6 |
| 22/03/2016 | 2049.8 |
| 23/03/2016 | 2036.71 |
| 24/03/2016 | 2035.94 |
| 28/03/2016 | 2037.05 |
| 29/03/2016 | 2055.01 |
| 30/03/2016 | 2063.95 |
| 31/03/2016 | 2059.74 |
| 01/04/2016 | 2072.78 |
| 04/04/2016 | 2066.13 |
| 05/04/2016 | 2045.17 |
| 06/04/2016 | 2066.66 |
| 07/04/2016 | 2041.91 |
| 08/04/2016 | 2047.6 |
| 11/04/2016 | 2041.99 |
| 12/04/2016 | 2061.72 |
| 13/04/2016 | 2082.42 |
| 14/04/2016 | 2082.78 |
| 15/04/2016 | 2080.73 |
| 18/04/2016 | 2094.34 |
| 19/04/2016 | 2100.8 |
| 20/04/2016 | 2102.4 |
| 21/04/2016 | 2091.48 |
| 22/04/2016 | 2091.58 |
| 25/04/2016 | 2087.79 |
| 26/04/2016 | 2091.7 |
| 27/04/2016 | 2095.15 |
| 28/04/2016 | 2075.81 |
| 29/04/2016 | 2065.3 |
| 02/05/2016 | 2081.43 |
| 03/05/2016 | 2063.37 |
| 04/05/2016 | 2051.12 |
| 05/05/2016 | 2050.63 |
| 06/05/2016 | 2057.14 |
| 09/05/2016 | 2058.69 |
| 10/05/2016 | 2084.39 |
| 11/05/2016 | 2064.46 |
| 12/05/2016 | 2064.11 |
| 13/05/2016 | 2046.61 |
| 16/05/2016 | 2066.66 |
| 17/05/2016 | 2047.21 |
| 18/05/2016 | 2047.63 |
| 19/05/2016 | 2040.04 |
| 20/05/2016 | 2052.32 |
| 23/05/2016 | 2048.04 |
| 24/05/2016 | 2076.06 |
| 25/05/2016 | 2090.54 |
| 26/05/2016 | 2090.1 |
| 27/05/2016 | 2099.06 |
| 31/05/2016 | 2096.95 |
| 01/06/2016 | 2099.33 |
| 02/06/2016 | 2105.26 |
| 03/06/2016 | 2099.13 |
| 06/06/2016 | 2109.41 |
| 07/06/2016 | 2112.13 |
| 08/06/2016 | 2119.12 |
| 09/06/2016 | 2115.48 |
| 10/06/2016 | 2096.07 |
| 13/06/2016 | 2079.06 |
| 14/06/2016 | 2075.32 |
| 15/06/2016 | 2071.5 |
| 16/06/2016 | 2077.99 |
| 17/06/2016 | 2071.22 |
| 20/06/2016 | 2083.25 |
| 21/06/2016 | 2088.9 |
| 22/06/2016 | 2085.45 |
| 23/06/2016 | 2113.32 |
| 24/06/2016 | 2037.41 |
| 27/06/2016 | 2000.54 |
| 28/06/2016 | 2036.09 |
| 29/06/2016 | 2070.77 |
| 30/06/2016 | 2098.86 |
| 01/07/2016 | 2102.95 |
| 05/07/2016 | 2088.55 |
| 06/07/2016 | 2099.73 |
| 07/07/2016 | 2097.9 |
| 08/07/2016 | 2129.9 |
| 11/07/2016 | 2137.16 |
| 12/07/2016 | 2152.14 |
| 13/07/2016 | 2152.43 |
| 14/07/2016 | 2163.75 |
| 15/07/2016 | 2161.74 |
| 18/07/2016 | 2166.89 |
| 19/07/2016 | 2163.78 |
| 20/07/2016 | 2173.02 |
| 21/07/2016 | 2165.17 |
| 22/07/2016 | 2175.03 |
| 25/07/2016 | 2168.48 |
| 26/07/2016 | 2169.18 |
| 27/07/2016 | 2166.58 |
| 28/07/2016 | 2170.06 |
| 29/07/2016 | 2173.6 |
| 01/08/2016 | 2170.84 |
| 02/08/2016 | 2157.03 |
| 03/08/2016 | 2163.79 |
| 04/08/2016 | 2164.25 |
| 05/08/2016 | 2182.87 |
| 08/08/2016 | 2180.89 |
| 09/08/2016 | 2181.74 |
| 10/08/2016 | 2175.49 |
| 11/08/2016 | 2185.79 |
| 12/08/2016 | 2184.05 |
| 15/08/2016 | 2190.15 |
| 16/08/2016 | 2178.15 |
| 17/08/2016 | 2182.22 |
| 18/08/2016 | 2187.02 |
| 19/08/2016 | 2183.87 |
| 22/08/2016 | 2182.64 |
| 23/08/2016 | 2186.9 |
| 24/08/2016 | 2175.44 |
| 25/08/2016 | 2172.47 |
| 26/08/2016 | 2169.04 |
| 29/08/2016 | 2180.38 |
| 30/08/2016 | 2176.12 |
| 31/08/2016 | 2170.95 |
| 01/09/2016 | 2170.86 |
| 02/09/2016 | 2179.98 |
| 06/09/2016 | 2186.48 |
| 07/09/2016 | 2186.16 |
| 08/09/2016 | 2181.3 |
| 09/09/2016 | 2127.81 |
| 12/09/2016 | 2159.04 |
| 13/09/2016 | 2127.02 |
| 14/09/2016 | 2125.77 |
| 15/09/2016 | 2147.26 |
| 16/09/2016 | 2139.16 |
| 19/09/2016 | 2139.12 |
| 20/09/2016 | 2139.76 |
| 21/09/2016 | 2163.12 |
| 22/09/2016 | 2177.18 |
| 23/09/2016 | 2164.69 |
| 26/09/2016 | 2146.1 |
| 27/09/2016 | 2159.93 |
| 28/09/2016 | 2171.37 |
| 29/09/2016 | 2151.13 |
| 30/09/2016 | 2168.27 |
| 03/10/2016 | 2161.2 |
| 04/10/2016 | 2150.49 |
| 05/10/2016 | 2159.73 |
| 06/10/2016 | 2160.77 |
| 07/10/2016 | 2153.74 |
| 10/10/2016 | 2163.66 |
| 11/10/2016 | 2136.73 |
| 12/10/2016 | 2139.18 |
| 13/10/2016 | 2132.55 |
| 14/10/2016 | 2132.98 |
| 17/10/2016 | 2126.5 |
| 18/10/2016 | 2139.6 |
| 19/10/2016 | 2144.29 |
| 20/10/2016 | 2141.34 |
| 21/10/2016 | 2141.16 |
| 24/10/2016 | 2151.33 |
| 25/10/2016 | 2143.16 |
| 26/10/2016 | 2139.43 |
| 27/10/2016 | 2133.04 |
| 28/10/2016 | 2126.41 |
| 31/10/2016 | 2126.15 |
| 01/11/2016 | 2111.72 |
| 02/11/2016 | 2097.94 |
| 03/11/2016 | 2088.66 |
| 04/11/2016 | 2085.18 |
| 07/11/2016 | 2131.52 |
| 08/11/2016 | 2139.56 |
| 09/11/2016 | 2163.26 |
| 10/11/2016 | 2167.48 |
| 11/11/2016 | 2164.45 |
| 14/11/2016 | 2164.2 |
| 15/11/2016 | 2180.39 |
| 16/11/2016 | 2176.94 |
| 17/11/2016 | 2187.12 |
| 18/11/2016 | 2181.9 |
| 21/11/2016 | 2198.18 |
| 22/11/2016 | 2202.94 |
| 23/11/2016 | 2204.72 |
| 25/11/2016 | 2213.35 |
| 28/11/2016 | 2201.72 |
| 29/11/2016 | 2204.66 |
| 30/11/2016 | 2198.81 |
| 01/12/2016 | 2191.08 |
| 02/12/2016 | 2191.95 |
| 05/12/2016 | 2204.71 |
| 06/12/2016 | 2212.23 |
| 07/12/2016 | 2241.35 |
| 08/12/2016 | 2246.19 |
| 09/12/2016 | 2259.53 |
| 12/12/2016 | 2256.96 |
| 13/12/2016 | 2271.72 |
| 14/12/2016 | 2253.28 |
| 15/12/2016 | 2262.03 |
| 16/12/2016 | 2258.07 |
| 19/12/2016 | 2262.53 |
| 20/12/2016 | 2270.76 |
| 21/12/2016 | 2265.18 |
| 22/12/2016 | 2260.96 |
| 23/12/2016 | 2263.79 |
| 27/12/2016 | 2268.88 |
| 28/12/2016 | 2249.92 |
| 29/12/2016 | 2249.26 |
| 30/12/2016 | 2238.83 |
| 03/01/2017 | 2257.83 |
| 04/01/2017 | 2270.75 |
| 05/01/2017 | 2269 |
| 06/01/2017 | 2276.98 |
| 09/01/2017 | 2268.9 |
| 10/01/2017 | 2268.9 |
| 11/01/2017 | 2275.32 |
| 12/01/2017 | 2270.44 |
| 13/01/2017 | 2274.64 |
| 17/01/2017 | 2267.89 |
| 18/01/2017 | 2271.89 |
| 19/01/2017 | 2263.69 |
| 20/01/2017 | 2271.31 |
| 23/01/2017 | 2265.2 |
| 24/01/2017 | 2280.07 |
| 25/01/2017 | 2298.37 |
| 26/01/2017 | 2296.68 |
| 27/01/2017 | 2294.69 |
| 30/01/2017 | 2280.9 |
| 31/01/2017 | 2278.87 |
| 01/02/2017 | 2279.55 |
| 02/02/2017 | 2280.85 |
| 03/02/2017 | 2297.42 |
| 06/02/2017 | 2292.56 |
| 07/02/2017 | 2293.08 |
| 08/02/2017 | 2294.67 |
| 09/02/2017 | 2307.87 |
| 10/02/2017 | 2316.1 |
| 13/02/2017 | 2328.25 |
| 14/02/2017 | 2337.58 |
| 15/02/2017 | 2349.25 |
| 16/02/2017 | 2347.22 |
| 17/02/2017 | 2351.16 |
| 21/02/2017 | 2365.38 |
| 22/02/2017 | 2362.82 |
| 23/02/2017 | 2363.81 |
| 24/02/2017 | 2367.34 |
| 27/02/2017 | 2369.75 |
| 28/02/2017 | 2363.64 |
| 01/03/2017 | 2395.96 |
| 02/03/2017 | 2381.92 |
| 03/03/2017 | 2383.12 |
| 06/03/2017 | 2375.31 |
| 07/03/2017 | 2368.39 |
| 08/03/2017 | 2362.98 |
| 09/03/2017 | 2364.87 |
| 10/03/2017 | 2372.6 |
| 13/03/2017 | 2373.47 |
| 14/03/2017 | 2365.45 |
| 15/03/2017 | 2385.26 |
| 16/03/2017 | 2381.38 |
| 17/03/2017 | 2378.25 |
| 20/03/2017 | 2373.47 |
| 21/03/2017 | 2344.02 |
| 22/03/2017 | 2348.45 |
| 23/03/2017 | 2345.96 |
| 24/03/2017 | 2343.98 |
| 27/03/2017 | 2341.59 |
| 28/03/2017 | 2358.57 |
| 29/03/2017 | 2361.13 |
| 30/03/2017 | 2368.06 |
| 31/03/2017 | 2362.72 |
| 03/04/2017 | 2358.84 |
| 04/04/2017 | 2360.16 |
| 05/04/2017 | 2352.95 |
| 06/04/2017 | 2357.49 |
| 07/04/2017 | 2355.54 |
| 10/04/2017 | 2357.16 |
| 11/04/2017 | 2353.78 |
| 12/04/2017 | 2344.93 |
| 13/04/2017 | 2328.95 |
| 17/04/2017 | 2349.01 |
| 18/04/2017 | 2342.19 |
| 19/04/2017 | 2338.17 |
| 20/04/2017 | 2355.84 |
| 21/04/2017 | 2348.69 |
| 24/04/2017 | 2374.15 |
| 25/04/2017 | 2388.61 |
| 26/04/2017 | 2387.45 |
| 27/04/2017 | 2388.77 |
| 28/04/2017 | 2384.2 |
| 01/05/2017 | 2388.33 |
| 02/05/2017 | 2391.17 |
| 03/05/2017 | 2388.13 |
| 04/05/2017 | 2389.52 |
| 05/05/2017 | 2399.29 |
| 08/05/2017 | 2399.38 |
| 09/05/2017 | 2396.92 |
| 10/05/2017 | 2399.63 |
| 11/05/2017 | 2394.44 |
| 12/05/2017 | 2390.9 |
| 15/05/2017 | 2402.32 |
| 16/05/2017 | 2400.67 |
| 17/05/2017 | 2357.03 |
| 18/05/2017 | 2365.72 |
| 19/05/2017 | 2381.73 |
| 22/05/2017 | 2394.02 |
| 23/05/2017 | 2398.42 |
| 24/05/2017 | 2404.39 |
| 25/05/2017 | 2415.07 |
| 26/05/2017 | 2415.82 |
| 30/05/2017 | 2412.91 |
| 31/05/2017 | 2411.8 |
| 01/06/2017 | 2430.06 |
| 02/06/2017 | 2439.07 |
| 05/06/2017 | 2436.1 |
| 06/06/2017 | 2429.33 |
| 07/06/2017 | 2433.14 |
| 08/06/2017 | 2433.79 |
| 09/06/2017 | 2431.77 |
| 12/06/2017 | 2429.39 |
| 13/06/2017 | 2440.35 |
| 14/06/2017 | 2437.92 |
| 15/06/2017 | 2432.46 |
| 16/06/2017 | 2433.15 |
| 19/06/2017 | 2453.46 |
| 20/06/2017 | 2437.03 |
| 21/06/2017 | 2435.61 |
| 22/06/2017 | 2434.5 |
| 23/06/2017 | 2438.3 |
| 26/06/2017 | 2439.07 |
| 27/06/2017 | 2419.38 |
| 28/06/2017 | 2440.69 |
| 29/06/2017 | 2419.7 |
| 30/06/2017 | 2423.41 |
| 03/07/2017 | 2429.01 |
| 05/07/2017 | 2432.54 |
| 06/07/2017 | 2409.75 |
| 07/07/2017 | 2425.18 |
| 10/07/2017 | 2427.43 |
| 11/07/2017 | 2425.53 |
| 12/07/2017 | 2443.25 |
| 13/07/2017 | 2447.83 |
| 14/07/2017 | 2459.27 |
| 17/07/2017 | 2459.14 |
| 18/07/2017 | 2460.61 |
| 19/07/2017 | 2473.83 |
| 20/07/2017 | 2473.45 |
| 21/07/2017 | 2472.54 |
| 24/07/2017 | 2469.91 |
| 25/07/2017 | 2477.13 |
| 26/07/2017 | 2477.83 |
| 27/07/2017 | 2475.42 |
| 28/07/2017 | 2472.1 |
| 31/07/2017 | 2470.3 |
| 01/08/2017 | 2476.35 |
| 02/08/2017 | 2477.57 |
| 03/08/2017 | 2472.16 |
| 04/08/2017 | 2476.83 |
| 07/08/2017 | 2480.91 |
| 08/08/2017 | 2474.92 |
| 09/08/2017 | 2474.02 |
| 10/08/2017 | 2438.21 |
| 11/08/2017 | 2441.32 |
| 14/08/2017 | 2465.84 |
| 15/08/2017 | 2464.61 |
| 16/08/2017 | 2468.11 |
| 17/08/2017 | 2430.01 |
| 18/08/2017 | 2425.55 |
| 21/08/2017 | 2428.37 |
| 22/08/2017 | 2452.51 |
| 23/08/2017 | 2444.04 |
| 24/08/2017 | 2438.97 |
| 25/08/2017 | 2443.05 |
| 28/08/2017 | 2444.24 |
| 29/08/2017 | 2446.3 |
| 30/08/2017 | 2457.59 |
| 31/08/2017 | 2471.65 |
| 01/09/2017 | 2476.55 |
| 05/09/2017 | 2457.85 |
| 06/09/2017 | 2465.54 |
| 07/09/2017 | 2465.1 |
| 08/09/2017 | 2461.43 |
| 11/09/2017 | 2488.11 |
| 12/09/2017 | 2496.48 |
| 13/09/2017 | 2498.37 |
| 14/09/2017 | 2495.62 |
| 15/09/2017 | 2500.23 |
| 18/09/2017 | 2503.87 |
| 19/09/2017 | 2506.65 |
| 20/09/2017 | 2508.24 |
| 21/09/2017 | 2500.6 |
| 22/09/2017 | 2502.22 |
| 25/09/2017 | 2496.66 |
| 26/09/2017 | 2496.84 |
| 27/09/2017 | 2507.04 |
| 28/09/2017 | 2510.06 |
| 29/09/2017 | 2519.36 |
| 02/10/2017 | 2529.12 |
| 03/10/2017 | 2534.58 |
| 04/10/2017 | 2537.74 |
| 05/10/2017 | 2552.07 |
| 06/10/2017 | 2549.33 |
| 09/10/2017 | 2544.73 |
| 10/10/2017 | 2550.64 |
| 11/10/2017 | 2555.24 |
| 12/10/2017 | 2550.93 |
| 13/10/2017 | 2553.17 |
| 16/10/2017 | 2557.64 |
| 17/10/2017 | 2559.36 |
| 18/10/2017 | 2561.26 |
| 19/10/2017 | 2562.1 |
| 20/10/2017 | 2575.21 |
| 23/10/2017 | 2564.98 |
| 24/10/2017 | 2569.13 |
| 25/10/2017 | 2557.15 |
| 26/10/2017 | 2560.4 |
| 27/10/2017 | 2581.07 |
| 30/10/2017 | 2572.83 |
| 31/10/2017 | 2575.26 |
| 01/11/2017 | 2579.36 |
| 02/11/2017 | 2579.85 |
| 03/11/2017 | 2587.84 |
| 06/11/2017 | 2591.13 |
| 07/11/2017 | 2590.64 |
| 08/11/2017 | 2594.38 |
| 09/11/2017 | 2584.62 |
| 10/11/2017 | 2582.3 |
| 13/11/2017 | 2584.84 |
| 14/11/2017 | 2578.87 |
| 15/11/2017 | 2564.62 |
| 16/11/2017 | 2585.64 |
| 17/11/2017 | 2578.85 |
| 20/11/2017 | 2582.14 |
| 21/11/2017 | 2599.03 |
| 22/11/2017 | 2597.08 |
| 24/11/2017 | 2602.42 |
| 27/11/2017 | 2601.42 |
| 28/11/2017 | 2627.04 |
| 29/11/2017 | 2626.07 |
| 30/11/2017 | 2647.58 |
| 01/12/2017 | 2642.22 |
| 04/12/2017 | 2639.44 |
| 05/12/2017 | 2629.57 |
| 06/12/2017 | 2629.27 |
| 07/12/2017 | 2636.98 |
| 08/12/2017 | 2651.5 |
| 11/12/2017 | 2659.99 |
| 12/12/2017 | 2664.11 |
| 13/12/2017 | 2662.85 |
| 14/12/2017 | 2652.01 |
| 15/12/2017 | 2675.81 |
| 18/12/2017 | 2690.16 |
| 19/12/2017 | 2681.47 |
| 20/12/2017 | 2679.25 |
| 21/12/2017 | 2684.57 |
| 22/12/2017 | 2683.34 |
| 26/12/2017 | 2680.5 |
| 27/12/2017 | 2682.62 |
| 28/12/2017 | 2687.54 |
| 29/12/2017 | 2673.61 |
| 02/01/2018 | 2695.81 |
| 03/01/2018 | 2713.06 |
| 04/01/2018 | 2723.99 |
| 05/01/2018 | 2743.15 |
| 08/01/2018 | 2747.71 |
| 09/01/2018 | 2751.29 |
| 10/01/2018 | 2748.23 |
| 11/01/2018 | 2767.56 |
| 12/01/2018 | 2786.24 |
| 16/01/2018 | 2776.42 |
| 17/01/2018 | 2802.56 |
| 18/01/2018 | 2798.03 |
| 19/01/2018 | 2810.3 |
| 22/01/2018 | 2832.97 |
| 23/01/2018 | 2839.13 |
| 24/01/2018 | 2837.54 |
| 25/01/2018 | 2839.25 |
| 26/01/2018 | 2872.87 |
| 29/01/2018 | 2853.53 |
| 30/01/2018 | 2822.43 |
| 31/01/2018 | 2823.81 |
| 01/02/2018 | 2821.98 |
| 02/02/2018 | 2762.13 |
| 05/02/2018 | 2648.94 |
| 06/02/2018 | 2695.14 |
| 07/02/2018 | 2681.66 |
| 08/02/2018 | 2581 |
| 09/02/2018 | 2619.55 |
| 12/02/2018 | 2656 |
| 13/02/2018 | 2662.94 |
| 14/02/2018 | 2698.63 |
| 15/02/2018 | 2731.2 |
| 16/02/2018 | 2732.22 |
| 20/02/2018 | 2716.26 |
| 21/02/2018 | 2701.33 |
| 22/02/2018 | 2703.96 |
| 23/02/2018 | 2747.3 |
| 26/02/2018 | 2779.6 |
| 27/02/2018 | 2744.28 |
| 28/02/2018 | 2713.83 |
| 01/03/2018 | 2677.67 |
| 02/03/2018 | 2691.25 |
| 05/03/2018 | 2720.94 |
| 06/03/2018 | 2728.12 |
| 07/03/2018 | 2726.8 |
| 08/03/2018 | 2738.97 |
| 09/03/2018 | 2786.57 |
| 12/03/2018 | 2783.02 |
| 13/03/2018 | 2765.31 |
| 14/03/2018 | 2749.48 |
| 15/03/2018 | 2747.33 |
| 16/03/2018 | 2752.01 |
| 19/03/2018 | 2712.92 |
| 20/03/2018 | 2716.94 |
| 21/03/2018 | 2711.93 |
| 22/03/2018 | 2643.69 |
| 23/03/2018 | 2588.26 |
| 26/03/2018 | 2658.55 |
| 27/03/2018 | 2612.62 |
| 28/03/2018 | 2605 |
| 29/03/2018 | 2640.87 |
| 02/04/2018 | 2581.88 |
| 03/04/2018 | 2614.45 |
| 04/04/2018 | 2644.69 |
| 05/04/2018 | 2662.84 |
| 06/04/2018 | 2604.47 |
| 09/04/2018 | 2613.16 |
| 10/04/2018 | 2656.87 |
| 11/04/2018 | 2642.19 |
| 12/04/2018 | 2663.99 |
| 13/04/2018 | 2656.3 |
| 16/04/2018 | 2677.84 |
| 17/04/2018 | 2706.39 |
| 18/04/2018 | 2708.64 |
| 19/04/2018 | 2693.13 |
| 20/04/2018 | 2670.14 |
| 23/04/2018 | 2670.29 |
| 24/04/2018 | 2634.56 |
| 25/04/2018 | 2639.4 |
| 26/04/2018 | 2666.94 |
| 27/04/2018 | 2669.91 |
| 30/04/2018 | 2648.05 |
| 01/05/2018 | 2654.8 |
| 02/05/2018 | 2635.67 |
| 03/05/2018 | 2629.73 |
| 04/05/2018 | 2663.42 |
| 07/05/2018 | 2672.63 |
| 08/05/2018 | 2671.92 |
| 09/05/2018 | 2697.79 |
| 10/05/2018 | 2723.07 |
| 11/05/2018 | 2727.72 |
| 14/05/2018 | 2730.13 |
| 15/05/2018 | 2711.45 |
| 16/05/2018 | 2722.46 |
| 17/05/2018 | 2720.13 |
| 18/05/2018 | 2712.97 |
| 21/05/2018 | 2733.01 |
| 22/05/2018 | 2724.44 |
| 23/05/2018 | 2733.29 |
| 24/05/2018 | 2727.76 |
| 25/05/2018 | 2721.33 |
| 29/05/2018 | 2689.86 |
| 30/05/2018 | 2724.01 |
| 31/05/2018 | 2705.27 |
| 01/06/2018 | 2734.62 |
| 04/06/2018 | 2746.87 |
| 05/06/2018 | 2748.8 |
| 06/06/2018 | 2772.35 |
| 07/06/2018 | 2770.37 |
| 08/06/2018 | 2779.03 |
| 11/06/2018 | 2782 |
| 12/06/2018 | 2786.85 |
| 13/06/2018 | 2775.63 |
| 14/06/2018 | 2782.49 |
| 15/06/2018 | 2779.66 |
| 18/06/2018 | 2773.75 |
| 19/06/2018 | 2762.59 |
| 20/06/2018 | 2767.32 |
| 21/06/2018 | 2749.76 |
| 22/06/2018 | 2754.88 |
| 25/06/2018 | 2717.07 |
| 26/06/2018 | 2723.06 |
| 27/06/2018 | 2699.63 |
| 28/06/2018 | 2716.31 |
| 29/06/2018 | 2718.37 |
| 02/07/2018 | 2726.71 |
| 03/07/2018 | 2713.22 |
| 05/07/2018 | 2736.61 |
| 06/07/2018 | 2759.82 |
| 09/07/2018 | 2784.17 |
| 10/07/2018 | 2793.84 |
| 11/07/2018 | 2774.02 |
| 12/07/2018 | 2798.29 |
| 13/07/2018 | 2801.31 |
| 16/07/2018 | 2798.43 |
| 17/07/2018 | 2809.55 |
| 18/07/2018 | 2815.62 |
| 19/07/2018 | 2804.49 |
| 20/07/2018 | 2801.83 |
| 23/07/2018 | 2806.98 |
| 24/07/2018 | 2820.4 |
| 25/07/2018 | 2846.07 |
| 26/07/2018 | 2837.44 |
| 27/07/2018 | 2818.82 |
| 30/07/2018 | 2802.6 |
| 31/07/2018 | 2816.29 |
| 01/08/2018 | 2813.36 |
| 02/08/2018 | 2827.22 |
| 03/08/2018 | 2840.35 |
| 06/08/2018 | 2850.4 |
| 07/08/2018 | 2858.45 |
| 08/08/2018 | 2857.7 |
| 09/08/2018 | 2853.58 |
| 10/08/2018 | 2833.28 |
| 13/08/2018 | 2821.93 |
| 14/08/2018 | 2839.96 |
| 15/08/2018 | 2818.37 |
| 16/08/2018 | 2840.69 |
| 17/08/2018 | 2850.13 |
| 20/08/2018 | 2857.05 |
| 21/08/2018 | 2862.96 |
| 22/08/2018 | 2861.82 |
| 23/08/2018 | 2856.98 |
| 24/08/2018 | 2874.69 |
| 27/08/2018 | 2896.74 |
| 28/08/2018 | 2897.52 |
| 29/08/2018 | 2914.04 |
| 30/08/2018 | 2901.13 |
| 31/08/2018 | 2901.52 |